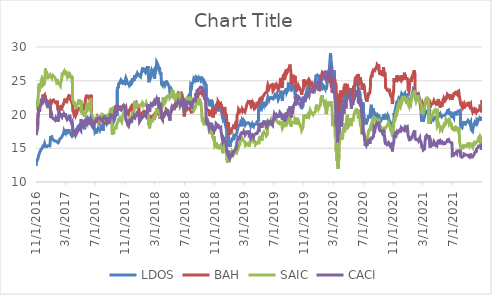
| Category | LDOS | BAH | SAIC | CACI |
|---|---|---|---|---|
| 11/1/16 | 12.394 | 18.057 | 22.082 | 16.935 |
| 11/2/16 | 12.337 | 18.748 | 21.898 | 16.935 |
| 11/3/16 | 13.289 | 19.079 | 21.998 | 17.208 |
| 11/4/16 | 13.101 | 18.947 | 20.738 | 17.488 |
| 11/7/16 | 13.227 | 19.271 | 21.367 | 17.897 |
| 11/8/16 | 13.026 | 19.301 | 21.473 | 18.178 |
| 11/9/16 | 13.478 | 20.167 | 22.561 | 19.498 |
| 11/10/16 | 13.724 | 20.107 | 22.758 | 20.102 |
| 11/11/16 | 13.906 | 20.63 | 24.046 | 20.732 |
| 11/14/16 | 14.191 | 21.123 | 24.602 | 21.03 |
| 11/15/16 | 14.346 | 21.081 | 24.131 | 20.399 |
| 11/16/16 | 14.331 | 21.123 | 24.022 | 20.852 |
| 11/17/16 | 14.236 | 21.044 | 23.904 | 21.15 |
| 11/18/16 | 14.478 | 21.111 | 24.037 | 21.235 |
| 11/21/16 | 14.804 | 21.399 | 24.457 | 21.473 |
| 11/22/16 | 14.81 | 21.946 | 25.02 | 21.992 |
| 11/23/16 | 14.879 | 22.175 | 25.092 | 21.924 |
| 11/25/16 | 14.963 | 22.241 | 25.386 | 21.882 |
| 11/28/16 | 15.044 | 22.361 | 25.389 | 21.822 |
| 11/29/16 | 15.346 | 22.962 | 25.494 | 22.248 |
| 11/30/16 | 15.328 | 22.728 | 24.968 | 22.035 |
| 12/1/16 | 15.328 | 22.15 | 24.403 | 21.839 |
| 12/2/16 | 15.439 | 22.565 | 24.539 | 22.12 |
| 12/5/16 | 15.532 | 22.565 | 24.569 | 22.452 |
| 12/6/16 | 15.682 | 22.818 | 24.748 | 22.682 |
| 12/7/16 | 15.604 | 22.613 | 24.832 | 22.393 |
| 12/8/16 | 15.648 | 22.776 | 25.978 | 22.478 |
| 12/9/16 | 15.643 | 22.662 | 26.807 | 22.452 |
| 12/12/16 | 15.059 | 21.946 | 25.727 | 21.856 |
| 12/13/16 | 15.274 | 22.144 | 25.679 | 21.643 |
| 12/14/16 | 15.268 | 21.862 | 25.476 | 21.541 |
| 12/15/16 | 15.319 | 21.796 | 25.506 | 21.533 |
| 12/16/16 | 15.319 | 21.844 | 25.237 | 21.337 |
| 12/19/16 | 15.37 | 21.928 | 25.818 | 21.499 |
| 12/20/16 | 15.406 | 21.988 | 25.9 | 21.524 |
| 12/21/16 | 15.376 | 21.85 | 25.806 | 21.226 |
| 12/22/16 | 15.292 | 21.814 | 25.57 | 21.218 |
| 12/23/16 | 15.286 | 21.742 | 25.688 | 21.311 |
| 12/27/16 | 15.343 | 21.802 | 25.791 | 21.345 |
| 12/28/16 | 15.238 | 21.646 | 25.485 | 21.098 |
| 12/29/16 | 15.385 | 21.79 | 25.821 | 21.337 |
| 12/30/16 | 16.633 | 21.969 | 25.643 | 19.493 |
| 1/3/17 | 16.571 | 21.756 | 25.425 | 19.501 |
| 1/4/17 | 16.701 | 21.872 | 25.833 | 19.846 |
| 1/5/17 | 16.513 | 21.89 | 25.664 | 19.572 |
| 1/6/17 | 16.477 | 22.055 | 25.888 | 19.525 |
| 1/9/17 | 16.256 | 21.982 | 25.513 | 19.438 |
| 1/10/17 | 16.35 | 22.201 | 25.715 | 19.423 |
| 1/11/17 | 16.295 | 22.158 | 25.624 | 19.438 |
| 1/12/17 | 16.259 | 22.158 | 25.718 | 19.399 |
| 1/13/17 | 16.249 | 22.128 | 25.646 | 19.383 |
| 1/17/17 | 16.074 | 21.805 | 25.446 | 19.18 |
| 1/18/17 | 16.204 | 21.835 | 25.425 | 19.336 |
| 1/19/17 | 16.161 | 21.677 | 25.295 | 19.172 |
| 1/20/17 | 16.152 | 21.708 | 25.162 | 19.321 |
| 1/23/17 | 16.028 | 21.634 | 24.829 | 19.023 |
| 1/24/17 | 16.09 | 21.799 | 24.896 | 19.368 |
| 1/25/17 | 16.148 | 21.823 | 24.914 | 19.289 |
| 1/26/17 | 16.113 | 22.048 | 25.035 | 19.282 |
| 1/27/17 | 16.116 | 22.085 | 25.25 | 19.211 |
| 1/30/17 | 15.813 | 20.648 | 24.475 | 18.944 |
| 1/31/17 | 15.716 | 20.599 | 24.62 | 19.258 |
| 2/1/17 | 15.712 | 20.514 | 24.43 | 19.328 |
| 2/2/17 | 15.966 | 20.995 | 24.805 | 20.63 |
| 2/3/17 | 16.161 | 21.019 | 24.567 | 20.418 |
| 2/6/17 | 16.301 | 21.08 | 24.463 | 20.301 |
| 2/7/17 | 16.415 | 21.123 | 24.549 | 20.277 |
| 2/8/17 | 16.292 | 20.818 | 24.252 | 19.791 |
| 2/9/17 | 16.529 | 20.83 | 24.546 | 19.995 |
| 2/10/17 | 16.535 | 20.77 | 24.78 | 19.83 |
| 2/13/17 | 16.584 | 20.782 | 25.152 | 19.815 |
| 2/14/17 | 16.607 | 20.739 | 25.178 | 19.619 |
| 2/15/17 | 16.789 | 21.05 | 25.654 | 19.783 |
| 2/16/17 | 16.916 | 21.172 | 26.194 | 20.011 |
| 2/17/17 | 16.896 | 21.141 | 26.031 | 19.87 |
| 2/21/17 | 17.127 | 21.549 | 26.257 | 20.034 |
| 2/22/17 | 17.28 | 21.695 | 26.29 | 20.175 |
| 2/23/17 | 17.072 | 21.525 | 26.147 | 19.705 |
| 2/24/17 | 17.589 | 21.878 | 26.426 | 19.987 |
| 2/27/17 | 17.576 | 22.341 | 26.509 | 20.081 |
| 2/28/17 | 17.336 | 21.787 | 25.835 | 19.666 |
| 3/1/17 | 17.788 | 22.042 | 26.486 | 20.144 |
| 3/2/17 | 17.414 | 22.048 | 26.394 | 19.713 |
| 3/3/17 | 17.462 | 21.957 | 26.153 | 19.658 |
| 3/6/17 | 17.293 | 21.89 | 25.936 | 19.391 |
| 3/7/17 | 17.244 | 22.036 | 25.957 | 19.297 |
| 3/8/17 | 17.144 | 22.116 | 25.82 | 19.227 |
| 3/9/17 | 17.215 | 22.176 | 25.55 | 19.195 |
| 3/10/17 | 17.176 | 22.396 | 25.633 | 19.18 |
| 3/13/17 | 17.547 | 22.633 | 25.856 | 19.423 |
| 3/14/17 | 17.459 | 22.524 | 25.936 | 19.399 |
| 3/15/17 | 17.846 | 22.81 | 26.257 | 19.674 |
| 3/16/17 | 17.479 | 22.682 | 25.817 | 19.485 |
| 3/17/17 | 17.547 | 22.913 | 26.007 | 19.94 |
| 3/20/17 | 17.524 | 22.737 | 25.847 | 19.674 |
| 3/21/17 | 17.17 | 22.28 | 25.375 | 19.156 |
| 3/22/17 | 17.196 | 22.359 | 25.645 | 19.18 |
| 3/23/17 | 17.134 | 22.286 | 25.871 | 19.227 |
| 3/24/17 | 17.114 | 22.152 | 25.574 | 18.976 |
| 3/27/17 | 16.822 | 21.774 | 25.458 | 18.615 |
| 3/28/17 | 16.815 | 21.805 | 25.39 | 18.725 |
| 3/29/17 | 16.988 | 21.774 | 25.621 | 18.788 |
| 3/30/17 | 16.692 | 21.543 | 22.27 | 18.544 |
| 3/31/17 | 17.672 | 20.538 | 22.101 | 17.755 |
| 4/3/17 | 17.468 | 20.358 | 21.697 | 17.157 |
| 4/4/17 | 17.523 | 20.294 | 21.938 | 17.157 |
| 4/5/17 | 17.261 | 20.044 | 21.596 | 17.127 |
| 4/6/17 | 17.295 | 20.091 | 21.658 | 17.233 |
| 4/7/17 | 17.496 | 20.253 | 21.697 | 17.384 |
| 4/10/17 | 17.492 | 20.282 | 21.552 | 17.551 |
| 4/11/17 | 17.624 | 20.497 | 21.658 | 17.619 |
| 4/12/17 | 17.537 | 20.172 | 21.234 | 17.293 |
| 4/13/17 | 17.499 | 19.928 | 20.824 | 17.006 |
| 4/17/17 | 17.72 | 20.265 | 21.299 | 17.301 |
| 4/18/17 | 17.748 | 20.334 | 21.293 | 17.316 |
| 4/19/17 | 17.879 | 20.497 | 21.403 | 17.452 |
| 4/20/17 | 18.176 | 20.735 | 21.593 | 17.77 |
| 4/21/17 | 18.042 | 20.688 | 21.48 | 17.558 |
| 4/24/17 | 18.29 | 20.752 | 22.048 | 18.088 |
| 4/25/17 | 18.366 | 20.834 | 22.062 | 17.974 |
| 4/26/17 | 18.453 | 21.089 | 22.282 | 18.33 |
| 4/27/17 | 18.436 | 20.996 | 22.033 | 18.262 |
| 4/28/17 | 18.197 | 20.851 | 21.682 | 17.861 |
| 5/1/17 | 18.484 | 20.799 | 21.822 | 17.959 |
| 5/2/17 | 18.508 | 20.648 | 21.777 | 17.861 |
| 5/3/17 | 18.522 | 20.602 | 21.575 | 17.611 |
| 5/4/17 | 18.795 | 20.805 | 22.074 | 19.291 |
| 5/5/17 | 18.823 | 20.799 | 20.484 | 19.125 |
| 5/8/17 | 18.422 | 20.758 | 20.22 | 19.11 |
| 5/9/17 | 18.159 | 20.648 | 19.994 | 18.852 |
| 5/10/17 | 18.118 | 20.741 | 20.148 | 18.913 |
| 5/11/17 | 18.211 | 20.776 | 19.959 | 18.648 |
| 5/12/17 | 18.201 | 20.886 | 20.11 | 18.603 |
| 5/15/17 | 18.246 | 21.159 | 20.484 | 18.777 |
| 5/16/17 | 18.56 | 21.106 | 20.484 | 18.92 |
| 5/17/17 | 18.062 | 20.677 | 19.662 | 18.489 |
| 5/18/17 | 17.807 | 20.654 | 19.824 | 18.239 |
| 5/19/17 | 18.007 | 20.863 | 19.766 | 18.383 |
| 5/22/17 | 18.443 | 22.342 | 20.173 | 18.807 |
| 5/23/17 | 18.892 | 22.244 | 20.39 | 18.822 |
| 5/24/17 | 18.971 | 22.377 | 20.596 | 18.883 |
| 5/25/17 | 19.051 | 22.743 | 21.025 | 19.193 |
| 5/26/17 | 18.964 | 22.772 | 21.209 | 19.254 |
| 5/30/17 | 18.954 | 22.778 | 20.877 | 18.754 |
| 5/31/17 | 19.199 | 22.888 | 20.885 | 18.633 |
| 6/1/17 | 19.479 | 22.871 | 21.193 | 19.117 |
| 6/2/17 | 19.334 | 22.76 | 21.352 | 18.89 |
| 6/5/17 | 19.31 | 22.546 | 21.355 | 18.731 |
| 6/6/17 | 19.327 | 22.209 | 20.981 | 18.731 |
| 6/7/17 | 19.237 | 22.372 | 20.879 | 18.519 |
| 6/8/17 | 19.258 | 22.58 | 21.22 | 18.754 |
| 6/9/17 | 19.134 | 22.383 | 21.176 | 18.694 |
| 6/12/17 | 19.22 | 22.633 | 22.383 | 19.405 |
| 6/13/17 | 19.244 | 22.743 | 20.481 | 19.299 |
| 6/14/17 | 19.054 | 22.94 | 20.385 | 19.216 |
| 6/15/17 | 19.065 | 22.824 | 20.291 | 19.087 |
| 6/16/17 | 18.653 | 18.512 | 19.511 | 18.383 |
| 6/19/17 | 18.636 | 18.837 | 19.59 | 18.308 |
| 6/20/17 | 18.446 | 18.704 | 19.607 | 18.164 |
| 6/21/17 | 18.574 | 18.774 | 19.632 | 18.292 |
| 6/22/17 | 18.526 | 19.087 | 19.64 | 19.057 |
| 6/23/17 | 18.508 | 18.698 | 19.464 | 18.852 |
| 6/26/17 | 18.56 | 18.832 | 19.324 | 18.694 |
| 6/27/17 | 18.021 | 18.704 | 19.013 | 18.565 |
| 6/28/17 | 18.066 | 18.971 | 19.414 | 19.057 |
| 6/29/17 | 17.783 | 18.774 | 18.991 | 18.852 |
| 6/30/17 | 17.366 | 18.696 | 19.079 | 18.963 |
| 7/3/17 | 17.474 | 18.702 | 19.285 | 19.122 |
| 7/5/17 | 17.591 | 19.024 | 19.398 | 19.054 |
| 7/6/17 | 17.198 | 18.944 | 19.126 | 18.836 |
| 7/7/17 | 17.494 | 19.392 | 19.563 | 19.32 |
| 7/10/17 | 17.494 | 19.11 | 19.316 | 19.198 |
| 7/11/17 | 17.544 | 19.202 | 19.588 | 19.388 |
| 7/12/17 | 17.836 | 19.455 | 19.893 | 19.388 |
| 7/13/17 | 17.675 | 19.449 | 19.725 | 19.297 |
| 7/14/17 | 17.887 | 19.438 | 19.761 | 19.456 |
| 7/17/17 | 17.833 | 18.961 | 19.404 | 19.494 |
| 7/18/17 | 17.668 | 18.961 | 19.11 | 19.342 |
| 7/19/17 | 17.937 | 19.254 | 19.524 | 19.547 |
| 7/20/17 | 18.015 | 19.271 | 19.423 | 19.479 |
| 7/21/17 | 17.954 | 19.34 | 19.228 | 19.304 |
| 7/24/17 | 17.924 | 19.443 | 19.142 | 19.327 |
| 7/25/17 | 18.105 | 19.616 | 19.492 | 19.357 |
| 7/26/17 | 17.968 | 19.627 | 19.728 | 19.115 |
| 7/27/17 | 17.941 | 19.506 | 19.643 | 19.153 |
| 7/28/17 | 18.008 | 19.685 | 19.632 | 19.206 |
| 7/31/17 | 17.954 | 19.708 | 19.351 | 18.971 |
| 8/1/17 | 17.914 | 19.759 | 19.728 | 19.471 |
| 8/2/17 | 17.561 | 19.547 | 19.274 | 19.191 |
| 8/3/17 | 19.029 | 19.8 | 19.879 | 19.471 |
| 8/4/17 | 18.878 | 19.886 | 19.939 | 19.524 |
| 8/7/17 | 18.932 | 19.185 | 19.908 | 19.661 |
| 8/8/17 | 19.036 | 19.047 | 19.718 | 19.752 |
| 8/9/17 | 18.875 | 18.558 | 19.42 | 19.585 |
| 8/10/17 | 18.972 | 18.771 | 19.3 | 19.539 |
| 8/11/17 | 19.043 | 19.11 | 19.312 | 19.494 |
| 8/14/17 | 19.274 | 19.357 | 19.682 | 19.426 |
| 8/15/17 | 19.251 | 19.363 | 19.68 | 19.342 |
| 8/16/17 | 19.221 | 19.506 | 20.011 | 19.532 |
| 8/17/17 | 18.794 | 19.254 | 19.392 | 19.001 |
| 8/18/17 | 18.592 | 19.351 | 19.267 | 18.652 |
| 8/21/17 | 18.582 | 19.489 | 19.418 | 18.781 |
| 8/22/17 | 18.784 | 19.782 | 19.841 | 19.145 |
| 8/23/17 | 18.888 | 19.754 | 19.749 | 19.024 |
| 8/24/17 | 18.663 | 19.535 | 19.941 | 18.963 |
| 8/25/17 | 18.767 | 19.518 | 19.902 | 18.933 |
| 8/28/17 | 18.781 | 19.271 | 19.905 | 19.001 |
| 8/29/17 | 19.022 | 19.489 | 20.028 | 19.107 |
| 8/30/17 | 19.264 | 19.472 | 20.348 | 19.092 |
| 8/31/17 | 19.594 | 19.598 | 20.588 | 19.683 |
| 9/1/17 | 19.735 | 19.914 | 20.738 | 19.964 |
| 9/5/17 | 19.419 | 19.794 | 20.755 | 19.941 |
| 9/6/17 | 19.473 | 19.96 | 20.858 | 19.881 |
| 9/7/17 | 19.385 | 19.972 | 20.805 | 19.6 |
| 9/8/17 | 19.187 | 19.926 | 17.015 | 19.342 |
| 9/11/17 | 19.288 | 20.035 | 17.085 | 19.744 |
| 9/12/17 | 19.379 | 20.121 | 17.325 | 20.01 |
| 9/13/17 | 19.197 | 19.88 | 17.342 | 19.956 |
| 9/14/17 | 18.925 | 19.794 | 17.135 | 19.562 |
| 9/15/17 | 18.948 | 20.254 | 17.634 | 19.691 |
| 9/18/17 | 19.261 | 20.644 | 17.634 | 19.903 |
| 9/19/17 | 19.493 | 20.88 | 18.086 | 20.252 |
| 9/20/17 | 19.543 | 21.127 | 18.164 | 20.426 |
| 9/21/17 | 19.577 | 21.173 | 18.158 | 20.381 |
| 9/22/17 | 19.765 | 21.178 | 18.021 | 20.707 |
| 9/25/17 | 19.681 | 21.178 | 18.021 | 20.836 |
| 9/26/17 | 19.731 | 21.345 | 18.275 | 20.889 |
| 9/27/17 | 19.966 | 21.403 | 18.59 | 21.427 |
| 9/28/17 | 19.792 | 21.351 | 18.587 | 21.185 |
| 9/29/17 | 23.644 | 20.666 | 18.629 | 20.632 |
| 10/2/17 | 24.119 | 20.831 | 18.913 | 21.054 |
| 10/3/17 | 23.924 | 20.969 | 18.866 | 21.083 |
| 10/4/17 | 24.055 | 21.008 | 19.025 | 20.95 |
| 10/5/17 | 24.566 | 20.964 | 19.342 | 21.113 |
| 10/6/17 | 24.654 | 20.831 | 19.337 | 21.054 |
| 10/9/17 | 24.754 | 20.804 | 19.498 | 21.12 |
| 10/10/17 | 24.814 | 20.886 | 19.599 | 21.216 |
| 10/11/17 | 24.81 | 20.726 | 19.518 | 21.046 |
| 10/12/17 | 24.882 | 21.185 | 19.278 | 21.068 |
| 10/13/17 | 25.057 | 21.312 | 19.214 | 21.246 |
| 10/16/17 | 24.786 | 21.063 | 19.175 | 21.098 |
| 10/17/17 | 24.682 | 20.787 | 18.919 | 20.942 |
| 10/18/17 | 24.514 | 20.859 | 19.153 | 20.957 |
| 10/19/17 | 24.562 | 20.876 | 19.462 | 20.965 |
| 10/20/17 | 24.826 | 20.969 | 19.752 | 21.194 |
| 10/23/17 | 24.666 | 20.859 | 19.911 | 21.179 |
| 10/24/17 | 24.45 | 20.853 | 20.117 | 21.216 |
| 10/25/17 | 25.049 | 20.765 | 20.334 | 21.401 |
| 10/26/17 | 24.942 | 20.71 | 20.404 | 21.438 |
| 10/27/17 | 24.898 | 20.748 | 20.524 | 21.416 |
| 10/30/17 | 24.73 | 20.671 | 20.206 | 21.209 |
| 10/31/17 | 24.962 | 20.886 | 20.438 | 21.283 |
| 11/1/17 | 25.085 | 20.876 | 20.304 | 21.046 |
| 11/2/17 | 25.081 | 20.898 | 19.972 | 19.758 |
| 11/3/17 | 25.417 | 21.074 | 19.468 | 19.247 |
| 11/6/17 | 25.133 | 20.229 | 19.394 | 18.966 |
| 11/7/17 | 24.986 | 20.666 | 19.077 | 19.218 |
| 11/8/17 | 24.842 | 20.489 | 19.052 | 19.114 |
| 11/9/17 | 24.614 | 20.24 | 18.92 | 18.699 |
| 11/10/17 | 24.702 | 20.223 | 18.901 | 18.477 |
| 11/13/17 | 24.606 | 20.03 | 18.799 | 18.492 |
| 11/14/17 | 24.506 | 20.223 | 18.755 | 18.277 |
| 11/15/17 | 24.67 | 20.135 | 18.702 | 18.196 |
| 11/16/17 | 24.69 | 20.505 | 19.14 | 18.611 |
| 11/17/17 | 24.391 | 20.461 | 19 | 18.536 |
| 11/20/17 | 24.61 | 20.544 | 19.311 | 18.788 |
| 11/21/17 | 24.534 | 20.87 | 19.763 | 19.395 |
| 11/22/17 | 24.395 | 20.699 | 19.543 | 18.936 |
| 11/24/17 | 24.478 | 20.605 | 19.562 | 18.958 |
| 11/27/17 | 24.578 | 20.61 | 19.606 | 18.951 |
| 11/28/17 | 25.069 | 20.859 | 19.959 | 19.225 |
| 11/29/17 | 24.91 | 21.003 | 20.229 | 19.225 |
| 11/30/17 | 25.381 | 21.384 | 20.441 | 19.536 |
| 12/1/17 | 24.882 | 21.307 | 20.13 | 19.395 |
| 12/4/17 | 25.337 | 21.334 | 20.174 | 19.432 |
| 12/5/17 | 25.289 | 21.312 | 20.185 | 19.454 |
| 12/6/17 | 24.998 | 21.069 | 20.13 | 19.299 |
| 12/7/17 | 25.225 | 21.063 | 20.78 | 19.499 |
| 12/8/17 | 25.604 | 21.119 | 22.03 | 19.765 |
| 12/11/17 | 25.668 | 21.207 | 21.678 | 19.588 |
| 12/12/17 | 25.608 | 21.412 | 21.284 | 19.588 |
| 12/13/17 | 25.576 | 21.18 | 21.298 | 19.817 |
| 12/14/17 | 25.5 | 20.931 | 20.981 | 19.684 |
| 12/15/17 | 25.792 | 21.119 | 21.386 | 19.943 |
| 12/18/17 | 26.028 | 21.594 | 21.551 | 20.172 |
| 12/19/17 | 25.848 | 21.533 | 21.526 | 20.017 |
| 12/20/17 | 25.964 | 21.467 | 21.405 | 20.054 |
| 12/21/17 | 25.992 | 21.367 | 21.289 | 19.943 |
| 12/22/17 | 26.04 | 21.4 | 21.298 | 19.854 |
| 12/26/17 | 25.868 | 21.19 | 21.22 | 19.788 |
| 12/27/17 | 25.808 | 21.251 | 21.22 | 19.684 |
| 12/28/17 | 25.88 | 21.168 | 21.237 | 19.706 |
| 12/29/17 | 25.808 | 19.597 | 21.094 | 18.932 |
| 1/2/18 | 25.58 | 19.509 | 21.364 | 19.19 |
| 1/3/18 | 25.548 | 19.561 | 21.317 | 19.712 |
| 1/4/18 | 25.9 | 19.55 | 21.477 | 19.54 |
| 1/5/18 | 25.872 | 19.715 | 21.485 | 19.619 |
| 1/8/18 | 26.531 | 20.183 | 21.675 | 19.776 |
| 1/9/18 | 26.476 | 20.044 | 21.609 | 19.712 |
| 1/10/18 | 26.611 | 20.131 | 21.485 | 19.698 |
| 1/11/18 | 26.955 | 20.172 | 21.694 | 20.22 |
| 1/12/18 | 26.791 | 20.193 | 21.556 | 19.648 |
| 1/16/18 | 26.555 | 20.486 | 21.402 | 19.655 |
| 1/17/18 | 26.747 | 20.568 | 21.537 | 19.862 |
| 1/18/18 | 26.511 | 20.368 | 21.179 | 19.662 |
| 1/19/18 | 26.835 | 20.378 | 21.355 | 19.955 |
| 1/22/18 | 26.831 | 20.362 | 21.339 | 19.841 |
| 1/23/18 | 26.755 | 20.352 | 21.504 | 19.955 |
| 1/24/18 | 26.316 | 20.239 | 21.264 | 19.705 |
| 1/25/18 | 26.348 | 20.275 | 21.463 | 19.876 |
| 1/26/18 | 26.495 | 20.434 | 21.625 | 20.256 |
| 1/29/18 | 27.059 | 20.512 | 21.523 | 20.599 |
| 1/30/18 | 26.651 | 20.26 | 21.198 | 20.12 |
| 1/31/18 | 26.619 | 20.136 | 21.116 | 20.105 |
| 2/1/18 | 27.159 | 20.352 | 21.284 | 21.522 |
| 2/2/18 | 26.472 | 19.869 | 19.788 | 20.999 |
| 2/5/18 | 25.232 | 18.882 | 18.983 | 20.406 |
| 2/6/18 | 24.769 | 18.466 | 18.508 | 20.534 |
| 2/7/18 | 25.7 | 19.17 | 18.434 | 20.892 |
| 2/8/18 | 25.005 | 18.749 | 17.942 | 20.377 |
| 2/9/18 | 25.029 | 18.677 | 18.265 | 20.592 |
| 2/12/18 | 25.716 | 19.216 | 18.755 | 21.343 |
| 2/13/18 | 25.828 | 19.144 | 18.736 | 21.286 |
| 2/14/18 | 26.272 | 19.478 | 19.11 | 21.564 |
| 2/15/18 | 26.412 | 19.684 | 19.187 | 21.529 |
| 2/16/18 | 26.547 | 19.684 | 18.993 | 21.479 |
| 2/20/18 | 26.472 | 19.648 | 19.033 | 21.328 |
| 2/21/18 | 26.064 | 19.581 | 19.213 | 21.328 |
| 2/22/18 | 26.28 | 19.561 | 19.391 | 21.5 |
| 2/23/18 | 26.312 | 19.787 | 19.327 | 21.679 |
| 2/26/18 | 26.539 | 19.941 | 19.624 | 21.915 |
| 2/27/18 | 26.068 | 19.766 | 19.677 | 21.75 |
| 2/28/18 | 25.304 | 19.494 | 19.176 | 21.321 |
| 3/1/18 | 25.484 | 19.566 | 19.147 | 21.4 |
| 3/2/18 | 25.98 | 19.962 | 19.703 | 21.507 |
| 3/5/18 | 26.352 | 20.178 | 19.997 | 21.886 |
| 3/6/18 | 26.46 | 20.126 | 20.214 | 21.929 |
| 3/7/18 | 26.635 | 20.183 | 20.087 | 21.929 |
| 3/8/18 | 27.143 | 20.152 | 20.188 | 22.029 |
| 3/9/18 | 27.746 | 20.378 | 20.94 | 22.315 |
| 3/12/18 | 27.714 | 20.162 | 20.81 | 21.958 |
| 3/13/18 | 27.698 | 20.07 | 20.522 | 22.044 |
| 3/14/18 | 27.391 | 20.09 | 20.463 | 22.108 |
| 3/15/18 | 27.187 | 20.09 | 20.498 | 22.051 |
| 3/16/18 | 27.063 | 20.301 | 20.54 | 22.523 |
| 3/19/18 | 26.839 | 19.941 | 20.336 | 20.828 |
| 3/20/18 | 27.011 | 20.147 | 20.461 | 21.693 |
| 3/21/18 | 26.999 | 20.219 | 20.477 | 21.536 |
| 3/22/18 | 26.372 | 19.741 | 20.05 | 21.15 |
| 3/23/18 | 25.988 | 19.355 | 19.56 | 20.992 |
| 3/26/18 | 26.232 | 19.643 | 19.915 | 21.185 |
| 3/27/18 | 25.78 | 19.576 | 19.558 | 21.307 |
| 3/28/18 | 25.684 | 19.566 | 19.409 | 21.3 |
| 3/29/18 | 24.48 | 19.686 | 20.874 | 19.588 |
| 4/2/18 | 24.285 | 19.259 | 21.218 | 19.277 |
| 4/3/18 | 24.461 | 19.722 | 21.904 | 19.594 |
| 4/4/18 | 24.618 | 19.925 | 22.069 | 19.769 |
| 4/5/18 | 24.884 | 20.068 | 22.598 | 20.054 |
| 4/6/18 | 24.278 | 19.747 | 21.716 | 19.594 |
| 4/9/18 | 24.248 | 19.742 | 21.563 | 19.62 |
| 4/10/18 | 24.641 | 20.037 | 21.576 | 19.976 |
| 4/11/18 | 24.352 | 20.052 | 21.52 | 19.892 |
| 4/12/18 | 24.588 | 20.235 | 21.711 | 20.034 |
| 4/13/18 | 24.416 | 20.174 | 21.817 | 19.931 |
| 4/16/18 | 24.674 | 20.612 | 22.053 | 20.112 |
| 4/17/18 | 25.015 | 20.795 | 22.283 | 20.378 |
| 4/18/18 | 25.15 | 20.825 | 22.773 | 20.61 |
| 4/19/18 | 24.996 | 20.724 | 22.734 | 20.559 |
| 4/20/18 | 24.753 | 20.652 | 22.59 | 20.565 |
| 4/23/18 | 24.794 | 20.586 | 22.72 | 20.61 |
| 4/24/18 | 24.558 | 20.398 | 22.768 | 20.293 |
| 4/25/18 | 24.524 | 20.251 | 22.861 | 19.983 |
| 4/26/18 | 24.558 | 20.368 | 22.85 | 20.112 |
| 4/27/18 | 24.622 | 20.312 | 22.826 | 19.847 |
| 4/30/18 | 24.042 | 20.149 | 22.726 | 19.549 |
| 5/1/18 | 23.761 | 20.052 | 22.755 | 19.413 |
| 5/2/18 | 23.222 | 19.94 | 22.466 | 19.096 |
| 5/3/18 | 22.559 | 19.966 | 22.564 | 19.737 |
| 5/4/18 | 22.507 | 20.2 | 22.473 | 20.177 |
| 5/7/18 | 22.769 | 20.357 | 22.682 | 20.436 |
| 5/8/18 | 23.031 | 20.551 | 22.97 | 20.72 |
| 5/9/18 | 23.405 | 20.637 | 23.307 | 20.805 |
| 5/10/18 | 23.611 | 20.744 | 23.435 | 20.966 |
| 5/11/18 | 23.682 | 20.769 | 23.456 | 21.193 |
| 5/14/18 | 23.319 | 20.662 | 23.221 | 21.122 |
| 5/15/18 | 23.031 | 20.83 | 23.268 | 21.025 |
| 5/16/18 | 23.012 | 20.978 | 23.555 | 21.199 |
| 5/17/18 | 22.743 | 20.947 | 22.533 | 21.251 |
| 5/18/18 | 22.949 | 21.191 | 22.486 | 21.264 |
| 5/21/18 | 22.982 | 21.201 | 22.382 | 21.38 |
| 5/22/18 | 22.387 | 20.978 | 22.154 | 21.122 |
| 5/23/18 | 22.683 | 20.988 | 22.222 | 21.16 |
| 5/24/18 | 22.586 | 21.176 | 22.35 | 21.128 |
| 5/25/18 | 22.556 | 21.247 | 22.063 | 21.16 |
| 5/29/18 | 22.38 | 22.381 | 22.157 | 21.219 |
| 5/30/18 | 22.679 | 22.9 | 22.915 | 21.691 |
| 5/31/18 | 22.481 | 22.925 | 23.124 | 21.568 |
| 6/1/18 | 22.773 | 22.788 | 22.894 | 21.555 |
| 6/4/18 | 23.054 | 23.083 | 22.847 | 21.665 |
| 6/5/18 | 23.173 | 22.986 | 22.92 | 21.82 |
| 6/6/18 | 23.184 | 22.94 | 23.025 | 21.801 |
| 6/7/18 | 22.848 | 22.676 | 22.941 | 21.626 |
| 6/8/18 | 22.941 | 22.712 | 23.059 | 21.872 |
| 6/11/18 | 23.054 | 22.767 | 23.066 | 21.898 |
| 6/12/18 | 23.162 | 22.915 | 23.027 | 21.704 |
| 6/13/18 | 23.117 | 22.986 | 21.095 | 21.504 |
| 6/14/18 | 22.739 | 23.113 | 21.192 | 21.549 |
| 6/15/18 | 22.526 | 22.894 | 20.98 | 21.691 |
| 6/18/18 | 22.271 | 22.996 | 21.31 | 21.652 |
| 6/19/18 | 22.271 | 23.093 | 21.364 | 21.659 |
| 6/20/18 | 21.841 | 23.159 | 21.281 | 21.225 |
| 6/21/18 | 21.68 | 22.92 | 21.391 | 22.358 |
| 6/22/18 | 21.897 | 22.676 | 21.425 | 22.254 |
| 6/25/18 | 22.028 | 22.406 | 21.247 | 21.756 |
| 6/26/18 | 22.327 | 22.35 | 21.472 | 21.82 |
| 6/27/18 | 21.916 | 22.04 | 21.498 | 21.834 |
| 6/28/18 | 21.953 | 22.112 | 21.443 | 21.749 |
| 6/29/18 | 21.055 | 19.713 | 21.158 | 20.581 |
| 7/2/18 | 21.191 | 20.101 | 21.325 | 20.838 |
| 7/3/18 | 21.134 | 20.399 | 21.425 | 21.112 |
| 7/5/18 | 21.277 | 20.318 | 21.485 | 21.222 |
| 7/6/18 | 21.476 | 20.592 | 21.83 | 21.692 |
| 7/9/18 | 21.89 | 20.633 | 22.185 | 21.607 |
| 7/10/18 | 21.865 | 20.656 | 22.125 | 21.375 |
| 7/11/18 | 21.926 | 20.696 | 22.026 | 21.656 |
| 7/12/18 | 22.29 | 20.831 | 22.295 | 21.882 |
| 7/13/18 | 22.279 | 20.962 | 22.311 | 21.778 |
| 7/16/18 | 22.301 | 20.858 | 22.204 | 21.747 |
| 7/17/18 | 22.69 | 20.953 | 22.499 | 21.851 |
| 7/18/18 | 22.665 | 20.913 | 22.52 | 21.772 |
| 7/19/18 | 22.858 | 20.967 | 22.598 | 21.796 |
| 7/20/18 | 22.961 | 20.976 | 22.562 | 21.924 |
| 7/23/18 | 23.029 | 20.876 | 22.436 | 21.79 |
| 7/24/18 | 22.561 | 20.71 | 22.133 | 21.442 |
| 7/25/18 | 22.75 | 20.696 | 22.212 | 21.619 |
| 7/26/18 | 24.342 | 20.854 | 22.413 | 21.601 |
| 7/27/18 | 24.435 | 20.62 | 22.01 | 21.509 |
| 7/30/18 | 24.114 | 20.196 | 21.555 | 20.88 |
| 7/31/18 | 24.417 | 21.309 | 22.057 | 21.393 |
| 8/1/18 | 24.488 | 21.26 | 21.89 | 21.418 |
| 8/2/18 | 24.695 | 21.39 | 22.149 | 21.644 |
| 8/3/18 | 24.835 | 21.512 | 20.52 | 21.619 |
| 8/6/18 | 24.867 | 21.868 | 20.659 | 22.169 |
| 8/7/18 | 24.902 | 21.999 | 20.621 | 21.979 |
| 8/8/18 | 25.313 | 22.202 | 20.907 | 22.218 |
| 8/9/18 | 25.209 | 22.206 | 20.866 | 22.211 |
| 8/10/18 | 25.177 | 22.148 | 20.724 | 21.998 |
| 8/13/18 | 25.081 | 22.062 | 20.7 | 21.992 |
| 8/14/18 | 25.359 | 22.256 | 21.011 | 22.132 |
| 8/15/18 | 25.202 | 22.17 | 20.869 | 22.022 |
| 8/16/18 | 25.266 | 22.206 | 21.119 | 23.127 |
| 8/17/18 | 25.595 | 22.423 | 21.417 | 22.858 |
| 8/20/18 | 25.523 | 22.477 | 21.326 | 23.072 |
| 8/21/18 | 25.691 | 22.675 | 21.882 | 23.64 |
| 8/22/18 | 25.463 | 22.738 | 21.863 | 23.646 |
| 8/23/18 | 24.813 | 22.459 | 21.497 | 23.451 |
| 8/24/18 | 25.052 | 22.698 | 21.774 | 23.64 |
| 8/27/18 | 25.298 | 23.018 | 22.029 | 23.738 |
| 8/28/18 | 25.124 | 22.892 | 22.041 | 23.67 |
| 8/29/18 | 25.384 | 23.045 | 22.421 | 23.786 |
| 8/30/18 | 25.341 | 23.04 | 21.942 | 23.75 |
| 8/31/18 | 25.256 | 23.063 | 21.713 | 23.811 |
| 9/4/18 | 25.42 | 23.194 | 21.908 | 24.025 |
| 9/5/18 | 25.241 | 23.342 | 21.913 | 24.244 |
| 9/6/18 | 25.32 | 23.559 | 21.81 | 23.97 |
| 9/7/18 | 24.92 | 23.491 | 21.627 | 23.951 |
| 9/10/18 | 24.981 | 23.167 | 19.651 | 23.762 |
| 9/11/18 | 25.056 | 23.293 | 19.324 | 23.756 |
| 9/12/18 | 25.056 | 23.36 | 18.864 | 23.756 |
| 9/13/18 | 25.295 | 23.396 | 18.895 | 23.848 |
| 9/14/18 | 25.398 | 23.626 | 19.141 | 23.915 |
| 9/17/18 | 25.188 | 23.424 | 18.772 | 23.689 |
| 9/18/18 | 25.066 | 23.257 | 18.715 | 23.677 |
| 9/19/18 | 24.424 | 22.59 | 18.402 | 22.987 |
| 9/20/18 | 24.535 | 22.418 | 18.659 | 22.596 |
| 9/21/18 | 24.895 | 22.346 | 19.117 | 22.755 |
| 9/24/18 | 24.267 | 22.342 | 18.977 | 23.005 |
| 9/25/18 | 24.567 | 22.459 | 19.523 | 22.45 |
| 9/26/18 | 24.246 | 22.477 | 19.179 | 22.498 |
| 9/27/18 | 24.421 | 22.436 | 19.143 | 22.498 |
| 9/28/18 | 22.677 | 20.747 | 19.398 | 18.85 |
| 10/1/18 | 22.251 | 20.722 | 18.989 | 18.655 |
| 10/2/18 | 22.471 | 20.726 | 19.004 | 18.657 |
| 10/3/18 | 22.205 | 20.692 | 18.917 | 18.718 |
| 10/4/18 | 22.198 | 20.659 | 18.541 | 18.653 |
| 10/5/18 | 22.136 | 20.709 | 18.354 | 18.939 |
| 10/8/18 | 22.031 | 20.588 | 18.32 | 18.819 |
| 10/9/18 | 22.035 | 20.726 | 18.279 | 18.824 |
| 10/10/18 | 21.651 | 20.099 | 17.6 | 18.415 |
| 10/11/18 | 21.231 | 19.756 | 17.403 | 18.001 |
| 10/12/18 | 21.339 | 19.94 | 17.109 | 18.112 |
| 10/15/18 | 21.605 | 20.187 | 17.372 | 18.309 |
| 10/16/18 | 22.176 | 20.613 | 17.892 | 18.79 |
| 10/17/18 | 22.198 | 20.55 | 17.562 | 18.756 |
| 10/18/18 | 21.874 | 20.316 | 17.102 | 18.542 |
| 10/19/18 | 22.156 | 20.492 | 17.167 | 18.452 |
| 10/22/18 | 22.015 | 20.651 | 17.494 | 18.674 |
| 10/23/18 | 21.792 | 20.638 | 17.531 | 18.379 |
| 10/24/18 | 20.53 | 19.748 | 16.717 | 17.653 |
| 10/25/18 | 20.074 | 19.978 | 16.638 | 17.854 |
| 10/26/18 | 20.077 | 19.572 | 16.508 | 17.706 |
| 10/29/18 | 20.274 | 20.35 | 16.173 | 17.597 |
| 10/30/18 | 20.697 | 20.09 | 16.253 | 17.857 |
| 10/31/18 | 21.241 | 20.709 | 16.729 | 18.267 |
| 11/1/18 | 20.776 | 20.107 | 16.852 | 17.708 |
| 11/2/18 | 20.461 | 19.982 | 15.281 | 17.669 |
| 11/5/18 | 20.516 | 20.116 | 15.261 | 17.67 |
| 11/6/18 | 20.825 | 20.484 | 15.457 | 17.963 |
| 11/7/18 | 21.526 | 21.223 | 15.824 | 18.657 |
| 11/8/18 | 21.585 | 21.265 | 15.736 | 18.658 |
| 11/9/18 | 21.389 | 21.491 | 15.789 | 18.581 |
| 11/12/18 | 21.11 | 21.524 | 15.303 | 18.472 |
| 11/13/18 | 21.136 | 21.662 | 15.439 | 18.484 |
| 11/14/18 | 20.752 | 21.412 | 14.957 | 18.083 |
| 11/15/18 | 21.1 | 21.963 | 15.373 | 18.491 |
| 11/16/18 | 21.212 | 22.038 | 15.527 | 18.469 |
| 11/19/18 | 20.956 | 21.696 | 15.034 | 18.014 |
| 11/20/18 | 20.474 | 21.328 | 14.84 | 17.861 |
| 11/21/18 | 20.67 | 21.407 | 15.067 | 18.071 |
| 11/23/18 | 20.625 | 21.34 | 15.201 | 17.934 |
| 11/26/18 | 20.92 | 21.566 | 15.375 | 18.134 |
| 11/27/18 | 20.576 | 21.307 | 15.151 | 17.462 |
| 11/28/18 | 20.73 | 21.47 | 15.415 | 17.496 |
| 11/29/18 | 20.356 | 21.303 | 15.309 | 17.229 |
| 11/30/18 | 20.657 | 21.449 | 15.309 | 16.88 |
| 12/3/18 | 20.52 | 21.328 | 15.322 | 16.831 |
| 12/4/18 | 19.329 | 20.692 | 14.265 | 16.083 |
| 12/6/18 | 19.759 | 20.722 | 14.301 | 16.275 |
| 12/7/18 | 19.303 | 20.308 | 15.283 | 16.088 |
| 12/10/18 | 19.503 | 20.517 | 15.356 | 16.301 |
| 12/11/18 | 19.208 | 20.626 | 15.228 | 16.285 |
| 12/12/18 | 19.503 | 21.119 | 15.8 | 16.686 |
| 12/13/18 | 19.162 | 21.056 | 15.342 | 16.499 |
| 12/14/18 | 18.706 | 20.534 | 15.065 | 16.303 |
| 12/17/18 | 18.202 | 19.932 | 14.915 | 15.654 |
| 12/18/18 | 18.182 | 20.09 | 14.649 | 15.572 |
| 12/19/18 | 17.867 | 19.735 | 14.162 | 15.519 |
| 12/20/18 | 17.585 | 19.476 | 13.933 | 15.103 |
| 12/21/18 | 16.857 | 18.715 | 13.308 | 14.521 |
| 12/24/18 | 16.572 | 18.168 | 12.856 | 14.271 |
| 12/26/18 | 17.178 | 18.845 | 13.669 | 14.662 |
| 12/27/18 | 17.234 | 18.711 | 13.691 | 14.65 |
| 12/28/18 | 15.504 | 18.811 | 13.794 | 14.734 |
| 12/31/18 | 15.598 | 17.295 | 14.028 | 13.657 |
| 1/2/19 | 15.4 | 17.011 | 13.95 | 13.458 |
| 1/3/19 | 15.187 | 16.873 | 13.548 | 13.352 |
| 1/4/19 | 15.794 | 17.56 | 14.087 | 13.711 |
| 1/7/19 | 15.829 | 17.498 | 14.129 | 13.567 |
| 1/8/19 | 15.95 | 17.614 | 14.424 | 13.954 |
| 1/9/19 | 16.146 | 17.487 | 14.237 | 14.08 |
| 1/10/19 | 16.246 | 17.552 | 14.217 | 14.086 |
| 1/11/19 | 16.397 | 17.92 | 14.32 | 14.187 |
| 1/14/19 | 16.37 | 17.805 | 14.124 | 14.012 |
| 1/15/19 | 16.388 | 17.909 | 13.937 | 14.147 |
| 1/16/19 | 16.356 | 18.074 | 14.006 | 14.247 |
| 1/17/19 | 16.592 | 18.243 | 14.457 | 14.561 |
| 1/18/19 | 16.829 | 18.262 | 14.536 | 14.69 |
| 1/22/19 | 16.604 | 18.078 | 14.424 | 14.619 |
| 1/23/19 | 16.613 | 18.201 | 14.14 | 14.68 |
| 1/24/19 | 16.678 | 18.212 | 14.153 | 14.796 |
| 1/25/19 | 16.879 | 18.554 | 14.842 | 14.93 |
| 1/28/19 | 16.891 | 18.327 | 14.679 | 14.805 |
| 1/29/19 | 17.016 | 18.416 | 14.842 | 14.953 |
| 1/30/19 | 17.217 | 18.527 | 14.88 | 15.061 |
| 1/31/19 | 17.16 | 18.853 | 14.785 | 15.852 |
| 2/1/19 | 17.498 | 19.797 | 14.509 | 15.972 |
| 2/4/19 | 17.965 | 20.169 | 14.814 | 16.349 |
| 2/5/19 | 18.131 | 20.304 | 14.936 | 16.624 |
| 2/6/19 | 18.184 | 20.465 | 15.056 | 16.642 |
| 2/7/19 | 18.557 | 20.772 | 15.187 | 16.652 |
| 2/8/19 | 18.368 | 20.894 | 15.318 | 16.644 |
| 2/11/19 | 18.326 | 20.515 | 15.303 | 16.504 |
| 2/12/19 | 18.35 | 20.672 | 15.591 | 16.502 |
| 2/13/19 | 18.409 | 20.515 | 15.859 | 16.776 |
| 2/14/19 | 18.442 | 20.438 | 16.003 | 16.898 |
| 2/15/19 | 18.749 | 20.645 | 16.436 | 17.073 |
| 2/19/19 | 18.436 | 20.741 | 16.507 | 17.08 |
| 2/20/19 | 18.249 | 20.63 | 16.417 | 17.323 |
| 2/21/19 | 18.625 | 20.591 | 16.249 | 17.257 |
| 2/22/19 | 19.081 | 20.764 | 16.438 | 17.436 |
| 2/25/19 | 19.131 | 20.507 | 16.37 | 17.312 |
| 2/26/19 | 18.802 | 20.254 | 16.131 | 17.031 |
| 2/27/19 | 18.912 | 20.234 | 16.138 | 17.161 |
| 2/28/19 | 19.11 | 20.284 | 16.03 | 17.282 |
| 3/1/19 | 19.226 | 20.538 | 16.239 | 17.476 |
| 3/4/19 | 18.965 | 20.419 | 15.975 | 17.336 |
| 3/5/19 | 18.811 | 20.388 | 15.764 | 17.218 |
| 3/6/19 | 18.649 | 20.242 | 15.537 | 16.998 |
| 3/7/19 | 18.471 | 20.261 | 15.387 | 17.005 |
| 3/8/19 | 18.474 | 20.461 | 15.408 | 17.007 |
| 3/11/19 | 18.693 | 21.19 | 15.537 | 17.271 |
| 3/12/19 | 18.649 | 21.37 | 15.548 | 17.126 |
| 3/13/19 | 18.743 | 21.501 | 15.73 | 17.401 |
| 3/14/19 | 18.563 | 21.593 | 15.616 | 17.589 |
| 3/15/19 | 18.59 | 21.716 | 15.646 | 17.405 |
| 3/18/19 | 18.785 | 21.908 | 15.764 | 17.509 |
| 3/19/19 | 18.729 | 21.957 | 15.664 | 17.394 |
| 3/20/19 | 18.717 | 21.792 | 15.47 | 17.236 |
| 3/21/19 | 18.862 | 22.053 | 15.625 | 17.614 |
| 3/22/19 | 18.637 | 21.919 | 15.234 | 17.093 |
| 3/25/19 | 18.53 | 21.693 | 15.264 | 17.271 |
| 3/26/19 | 18.749 | 22.103 | 15.848 | 17.383 |
| 3/27/19 | 18.72 | 22.03 | 15.728 | 17.204 |
| 3/28/19 | 18.856 | 22.226 | 15.784 | 17.309 |
| 3/29/19 | 18.25 | 21.485 | 16.513 | 16.662 |
| 4/1/19 | 18.478 | 21.703 | 16.584 | 17.017 |
| 4/2/19 | 18.122 | 21.414 | 16.327 | 16.632 |
| 4/3/19 | 18.134 | 21.51 | 16.02 | 16.719 |
| 4/4/19 | 18.219 | 21.433 | 16.088 | 16.718 |
| 4/5/19 | 18.396 | 21.655 | 16.29 | 16.878 |
| 4/8/19 | 18.452 | 21.559 | 16.219 | 16.863 |
| 4/9/19 | 18.225 | 21.204 | 15.951 | 16.603 |
| 4/10/19 | 18.401 | 21.248 | 16.078 | 16.806 |
| 4/11/19 | 18.581 | 21.536 | 15.996 | 16.961 |
| 4/12/19 | 18.606 | 21.644 | 15.99 | 17.067 |
| 4/15/19 | 18.498 | 21.555 | 15.988 | 17.103 |
| 4/16/19 | 18.546 | 21.259 | 15.846 | 17.113 |
| 4/17/19 | 18.538 | 21.019 | 15.541 | 17.052 |
| 4/18/19 | 18.581 | 21.041 | 15.668 | 17.055 |
| 4/22/19 | 18.623 | 21.241 | 15.799 | 17.164 |
| 4/23/19 | 18.939 | 21.673 | 15.857 | 17.43 |
| 4/24/19 | 18.945 | 21.706 | 15.767 | 17.446 |
| 4/25/19 | 18.905 | 21.706 | 15.803 | 17.186 |
| 4/26/19 | 18.951 | 21.799 | 15.878 | 17.347 |
| 4/29/19 | 19.042 | 21.647 | 15.758 | 17.448 |
| 4/30/19 | 20.924 | 21.91 | 16.084 | 17.844 |
| 5/1/19 | 20.745 | 21.673 | 15.724 | 17.395 |
| 5/2/19 | 20.827 | 21.954 | 15.724 | 18.555 |
| 5/3/19 | 21.2 | 22.135 | 16.469 | 18.748 |
| 5/6/19 | 21.104 | 22.394 | 16.774 | 18.711 |
| 5/7/19 | 20.938 | 22.009 | 16.513 | 18.262 |
| 5/8/19 | 21.121 | 21.95 | 16.607 | 18.314 |
| 5/9/19 | 21.363 | 22.268 | 16.638 | 18.576 |
| 5/10/19 | 21.494 | 22.63 | 16.831 | 18.681 |
| 5/13/19 | 21.007 | 22.106 | 16.113 | 18.039 |
| 5/14/19 | 21.158 | 22.213 | 16.225 | 18.154 |
| 5/15/19 | 21.371 | 22.423 | 16.397 | 18.508 |
| 5/16/19 | 21.724 | 22.634 | 17.18 | 18.824 |
| 5/17/19 | 21.639 | 22.608 | 17.189 | 18.651 |
| 5/20/19 | 21.434 | 22.567 | 17.255 | 18.608 |
| 5/21/19 | 21.85 | 22.815 | 17.352 | 18.815 |
| 5/22/19 | 21.918 | 22.955 | 17.229 | 19.109 |
| 5/23/19 | 21.679 | 22.882 | 16.959 | 18.762 |
| 5/24/19 | 21.719 | 23.044 | 17.281 | 18.797 |
| 5/28/19 | 21.351 | 23.222 | 17.24 | 18.573 |
| 5/29/19 | 21.3 | 23.347 | 17.071 | 18.421 |
| 5/30/19 | 21.309 | 23.188 | 17.038 | 18.49 |
| 5/31/19 | 21.451 | 23.343 | 16.847 | 18.63 |
| 6/3/19 | 21.619 | 23.295 | 16.864 | 18.421 |
| 6/4/19 | 22.211 | 23.75 | 17.046 | 18.772 |
| 6/5/19 | 22.246 | 24.016 | 17.404 | 18.711 |
| 6/6/19 | 22.411 | 24.227 | 18.649 | 18.923 |
| 6/7/19 | 22.616 | 24.408 | 18.89 | 19.044 |
| 6/10/19 | 22.544 | 24.356 | 18.996 | 18.9 |
| 6/11/19 | 22.305 | 24.001 | 18.638 | 18.562 |
| 6/12/19 | 22.567 | 24.16 | 18.803 | 18.652 |
| 6/13/19 | 22.331 | 23.953 | 19.136 | 18.673 |
| 6/14/19 | 22.451 | 24.086 | 18.704 | 18.559 |
| 6/17/19 | 22.282 | 24.123 | 18.959 | 18.582 |
| 6/18/19 | 22.391 | 24.094 | 18.917 | 18.676 |
| 6/19/19 | 22.391 | 24.212 | 19.158 | 18.876 |
| 6/20/19 | 22.684 | 24.341 | 19.257 | 19.192 |
| 6/21/19 | 22.473 | 24.426 | 18.851 | 18.622 |
| 6/24/19 | 22.485 | 24.43 | 18.803 | 18.501 |
| 6/25/19 | 22.533 | 24.434 | 18.809 | 18.611 |
| 6/26/19 | 22.357 | 24.145 | 18.614 | 18.398 |
| 6/27/19 | 22.607 | 24.463 | 18.713 | 18.81 |
| 6/28/19 | 22.271 | 23.528 | 19.002 | 19.128 |
| 7/1/19 | 22.36 | 23.692 | 18.882 | 19.56 |
| 7/2/19 | 22.352 | 23.71 | 18.959 | 19.628 |
| 7/3/19 | 22.703 | 23.99 | 19.121 | 20.035 |
| 7/5/19 | 22.876 | 24.157 | 19.314 | 20.071 |
| 7/8/19 | 22.706 | 23.855 | 19.194 | 19.603 |
| 7/9/19 | 22.737 | 24.1 | 19.481 | 19.583 |
| 7/10/19 | 22.731 | 24.264 | 19.334 | 19.668 |
| 7/11/19 | 22.854 | 24.253 | 18.992 | 19.55 |
| 7/12/19 | 22.99 | 24.456 | 19.167 | 19.955 |
| 7/15/19 | 22.965 | 24.424 | 19.152 | 19.931 |
| 7/16/19 | 22.882 | 24.324 | 19.038 | 20.008 |
| 7/17/19 | 22.527 | 24.1 | 18.816 | 19.706 |
| 7/18/19 | 22.58 | 23.944 | 18.932 | 19.83 |
| 7/19/19 | 22.198 | 23.681 | 18.732 | 19.694 |
| 7/22/19 | 22.196 | 23.813 | 18.686 | 19.716 |
| 7/23/19 | 22.544 | 23.994 | 18.728 | 19.828 |
| 7/24/19 | 22.759 | 24.093 | 18.983 | 19.95 |
| 7/25/19 | 22.633 | 24.303 | 18.675 | 19.918 |
| 7/26/19 | 22.99 | 24.591 | 18.847 | 20.319 |
| 7/29/19 | 23.239 | 25.422 | 18.899 | 20.25 |
| 7/30/19 | 23.534 | 24.744 | 18.959 | 20.134 |
| 7/31/19 | 22.898 | 24.431 | 18.741 | 20.116 |
| 8/1/19 | 23.264 | 24.502 | 18.662 | 20.198 |
| 8/2/19 | 22.831 | 24.445 | 18.502 | 19.762 |
| 8/5/19 | 22.028 | 23.937 | 17.954 | 19.18 |
| 8/6/19 | 22.324 | 24.466 | 18.021 | 19.507 |
| 8/7/19 | 22.472 | 25.039 | 18.104 | 19.561 |
| 8/8/19 | 23.4 | 25.675 | 18.735 | 20.115 |
| 8/9/19 | 23.166 | 25.732 | 18.63 | 19.749 |
| 8/12/19 | 23.163 | 25.92 | 18.563 | 19.563 |
| 8/13/19 | 23.504 | 25.657 | 18.827 | 19.732 |
| 8/14/19 | 23.099 | 25.12 | 18.242 | 19.375 |
| 8/15/19 | 23.124 | 25.412 | 18.186 | 18.979 |
| 8/16/19 | 23.378 | 25.913 | 18.677 | 19.481 |
| 8/19/19 | 23.73 | 26.119 | 18.905 | 19.578 |
| 8/20/19 | 23.559 | 26.147 | 18.578 | 19.877 |
| 8/21/19 | 23.858 | 26.673 | 18.838 | 20.314 |
| 8/22/19 | 23.863 | 26.641 | 18.948 | 20.21 |
| 8/23/19 | 23.264 | 26.108 | 18.643 | 19.73 |
| 8/26/19 | 23.512 | 26.19 | 18.973 | 19.948 |
| 8/27/19 | 23.716 | 26.179 | 18.966 | 19.92 |
| 8/28/19 | 23.908 | 26.506 | 19.17 | 20.148 |
| 8/29/19 | 24.321 | 26.726 | 19.441 | 20.658 |
| 8/30/19 | 24.365 | 26.833 | 19.709 | 20.783 |
| 9/3/19 | 24.084 | 26.798 | 19.776 | 20.662 |
| 9/4/19 | 24.438 | 27.206 | 20.03 | 20.786 |
| 9/5/19 | 24.773 | 27.398 | 20.254 | 21.233 |
| 9/6/19 | 24.438 | 27.213 | 18.605 | 21.228 |
| 9/9/19 | 23.685 | 26.179 | 18.518 | 20.522 |
| 9/10/19 | 23.426 | 24.488 | 18.22 | 19.568 |
| 9/11/19 | 23.774 | 24.712 | 18.608 | 19.862 |
| 9/12/19 | 24.084 | 25.071 | 18.69 | 20.18 |
| 9/13/19 | 23.936 | 24.69 | 18.867 | 20.196 |
| 9/16/19 | 24.07 | 24.982 | 18.755 | 20.208 |
| 9/17/19 | 24.181 | 25.888 | 18.854 | 20.255 |
| 9/18/19 | 24.432 | 25.572 | 18.867 | 21.166 |
| 9/19/19 | 24.368 | 25.774 | 18.769 | 20.963 |
| 9/20/19 | 24.078 | 24.939 | 18.892 | 21.298 |
| 9/23/19 | 23.9 | 24.85 | 18.762 | 21.225 |
| 9/24/19 | 23.989 | 24.84 | 18.946 | 21.166 |
| 9/25/19 | 24.276 | 25.206 | 19.291 | 21.627 |
| 9/26/19 | 24.301 | 25.724 | 19.407 | 21.864 |
| 9/27/19 | 22.311 | 25.188 | 19.134 | 21.27 |
| 9/30/19 | 22.536 | 24.067 | 19.562 | 22.781 |
| 10/1/19 | 22.248 | 23.762 | 19.073 | 22.277 |
| 10/2/19 | 21.77 | 23.386 | 18.74 | 22.109 |
| 10/3/19 | 21.781 | 23.688 | 18.72 | 22.179 |
| 10/4/19 | 21.946 | 24.003 | 18.937 | 22.5 |
| 10/7/19 | 21.99 | 23.854 | 18.856 | 22.594 |
| 10/8/19 | 21.476 | 23.613 | 18.484 | 22.321 |
| 10/9/19 | 21.702 | 24.01 | 18.668 | 22.428 |
| 10/10/19 | 21.794 | 24.237 | 18.681 | 22.637 |
| 10/11/19 | 21.823 | 24.223 | 18.937 | 22.636 |
| 10/14/19 | 21.639 | 23.915 | 18.639 | 22.46 |
| 10/15/19 | 21.578 | 24.034 | 18.787 | 22.571 |
| 10/16/19 | 21.345 | 24.057 | 18.675 | 22.302 |
| 10/17/19 | 21.442 | 24.003 | 18.549 | 22.347 |
| 10/18/19 | 21.418 | 23.698 | 18.218 | 22.206 |
| 10/21/19 | 21.214 | 23.718 | 18.334 | 22.144 |
| 10/22/19 | 20.807 | 23.074 | 17.911 | 21.345 |
| 10/23/19 | 20.794 | 22.918 | 17.66 | 21.22 |
| 10/24/19 | 21.004 | 23.203 | 17.685 | 21.417 |
| 10/25/19 | 20.988 | 23.173 | 17.718 | 21.445 |
| 10/28/19 | 21.206 | 23.122 | 18.03 | 21.489 |
| 10/29/19 | 22.67 | 23.701 | 18.357 | 22.01 |
| 10/30/19 | 22.749 | 24.04 | 18.487 | 22.121 |
| 10/31/19 | 22.628 | 23.847 | 18.502 | 22.041 |
| 11/1/19 | 22.392 | 25.172 | 19.979 | 22.126 |
| 11/4/19 | 22.51 | 24.877 | 19.713 | 22.028 |
| 11/5/19 | 21.828 | 24.138 | 19.379 | 21.904 |
| 11/6/19 | 22.34 | 24.328 | 19.672 | 22.134 |
| 11/7/19 | 22.568 | 24.294 | 19.794 | 22.252 |
| 11/8/19 | 22.883 | 24.328 | 19.734 | 22.256 |
| 11/11/19 | 23.006 | 24.62 | 19.674 | 22.438 |
| 11/12/19 | 23.358 | 24.508 | 19.665 | 22.624 |
| 11/13/19 | 23.484 | 24.589 | 19.358 | 22.552 |
| 11/14/19 | 23.733 | 24.826 | 19.821 | 22.679 |
| 11/15/19 | 23.888 | 24.965 | 19.787 | 22.864 |
| 11/18/19 | 23.982 | 25.057 | 20.07 | 23.069 |
| 11/19/19 | 24.066 | 24.969 | 20.154 | 23.073 |
| 11/20/19 | 24.053 | 25.084 | 20.214 | 23.15 |
| 11/21/19 | 23.631 | 24.427 | 20.204 | 23.169 |
| 11/22/19 | 23.224 | 24.179 | 19.782 | 22.785 |
| 11/25/19 | 23.625 | 24.555 | 19.886 | 23.57 |
| 11/26/19 | 23.804 | 24.877 | 20.432 | 23.659 |
| 11/27/19 | 23.875 | 24.881 | 20.627 | 23.741 |
| 11/29/19 | 23.838 | 24.657 | 20.471 | 23.575 |
| 12/2/19 | 23.578 | 24.881 | 20.286 | 23.366 |
| 12/3/19 | 23.528 | 24.281 | 20.14 | 23.226 |
| 12/4/19 | 23.549 | 24.511 | 20.248 | 23.263 |
| 12/5/19 | 23.604 | 24.477 | 20.14 | 23.283 |
| 12/6/19 | 23.796 | 24.433 | 20.348 | 23.352 |
| 12/9/19 | 23.644 | 24.04 | 19.941 | 23.307 |
| 12/10/19 | 23.523 | 23.925 | 19.941 | 23.285 |
| 12/11/19 | 24.163 | 23.681 | 19.969 | 23.501 |
| 12/12/19 | 23.93 | 23.501 | 20.077 | 23.596 |
| 12/13/19 | 24.1 | 23.912 | 20.24 | 23.663 |
| 12/16/19 | 24.048 | 23.65 | 20.209 | 23.874 |
| 12/17/19 | 24.019 | 23.722 | 20.14 | 23.865 |
| 12/18/19 | 25.108 | 23.627 | 20.401 | 24.023 |
| 12/19/19 | 25.266 | 24.013 | 20.588 | 24.378 |
| 12/20/19 | 25.719 | 24.335 | 21.054 | 24.669 |
| 12/23/19 | 25.67 | 24.254 | 21.464 | 24.686 |
| 12/24/19 | 25.725 | 24.115 | 21.188 | 24.669 |
| 12/26/19 | 25.856 | 24.061 | 21.253 | 24.787 |
| 12/27/19 | 25.777 | 24.037 | 21.171 | 24.704 |
| 12/30/19 | 25.735 | 24.081 | 21.044 | 24.722 |
| 12/31/19 | 25.688 | 23.482 | 20.871 | 23.63 |
| 1/2/20 | 25.88 | 23.736 | 21.001 | 23.842 |
| 1/3/20 | 23.488 | 23.99 | 21.157 | 24.19 |
| 1/6/20 | 23.696 | 24.377 | 21.202 | 24.41 |
| 1/7/20 | 23.609 | 24.235 | 21.205 | 24.304 |
| 1/8/20 | 23.58 | 24.449 | 21.408 | 24.534 |
| 1/9/20 | 23.866 | 25.129 | 22.289 | 24.819 |
| 1/10/20 | 23.852 | 25.308 | 22.315 | 24.866 |
| 1/13/20 | 23.883 | 25.885 | 22.648 | 25.095 |
| 1/14/20 | 23.798 | 25.905 | 22.543 | 24.965 |
| 1/15/20 | 24.116 | 26.212 | 22.864 | 25.301 |
| 1/16/20 | 24.152 | 26.077 | 22.318 | 25.473 |
| 1/17/20 | 24.412 | 26.212 | 22.205 | 25.579 |
| 1/21/20 | 24.383 | 25.961 | 21.994 | 25.518 |
| 1/22/20 | 24.194 | 25.667 | 22.006 | 25.481 |
| 1/23/20 | 24.232 | 25.875 | 21.948 | 25.708 |
| 1/24/20 | 23.994 | 25.737 | 21.509 | 25.472 |
| 1/27/20 | 23.793 | 25.608 | 21.48 | 25.303 |
| 1/28/20 | 24.156 | 25.932 | 21.759 | 25.461 |
| 1/29/20 | 24.043 | 25.826 | 21.653 | 25.255 |
| 1/30/20 | 24.22 | 25.998 | 21.689 | 26.473 |
| 1/31/20 | 23.722 | 25.763 | 20.061 | 25.279 |
| 2/3/20 | 24.192 | 25.932 | 20.454 | 25.76 |
| 2/4/20 | 24.865 | 25.898 | 20.756 | 26.106 |
| 2/5/20 | 25.176 | 25.806 | 20.914 | 25.914 |
| 2/6/20 | 25.963 | 25.869 | 21.926 | 25.931 |
| 2/7/20 | 25.998 | 25.562 | 21.202 | 25.71 |
| 2/10/20 | 26.114 | 25.582 | 21.517 | 25.722 |
| 2/11/20 | 26.478 | 25.512 | 21.73 | 25.742 |
| 2/12/20 | 26.208 | 25.113 | 21.51 | 25.764 |
| 2/13/20 | 26.704 | 25.162 | 21.554 | 26.28 |
| 2/14/20 | 26.636 | 25.304 | 21.556 | 26.077 |
| 2/18/20 | 29.094 | 25.542 | 21.734 | 26.75 |
| 2/19/20 | 28.411 | 25.268 | 21.842 | 27.135 |
| 2/20/20 | 28.161 | 24.591 | 21.942 | 26.251 |
| 2/21/20 | 27.677 | 24.146 | 21.675 | 25.812 |
| 2/24/20 | 26.876 | 23.825 | 21.044 | 25.175 |
| 2/25/20 | 25.772 | 23.264 | 19.956 | 23.97 |
| 2/26/20 | 26.166 | 23.74 | 19.426 | 24.415 |
| 2/27/20 | 24.818 | 23.664 | 18.267 | 23.534 |
| 2/28/20 | 24.237 | 23.538 | 18.315 | 23.16 |
| 3/2/20 | 25.986 | 24.446 | 18.889 | 23.738 |
| 3/3/20 | 25.814 | 24.634 | 18.964 | 23.587 |
| 3/4/20 | 26.522 | 25.43 | 19.931 | 24.591 |
| 3/5/20 | 25.398 | 24.921 | 19.266 | 23.566 |
| 3/6/20 | 24.952 | 25.185 | 18.61 | 22.83 |
| 3/9/20 | 23.028 | 23.944 | 16.445 | 21.027 |
| 3/10/20 | 24.27 | 24.644 | 17.638 | 22.154 |
| 3/11/20 | 23.132 | 24.377 | 16.285 | 20.697 |
| 3/12/20 | 20.258 | 21.917 | 14.514 | 18.384 |
| 3/13/20 | 21.323 | 23.106 | 15.728 | 20.724 |
| 3/16/20 | 18.417 | 21.075 | 13.122 | 17.852 |
| 3/17/20 | 19.215 | 21.782 | 14.256 | 17.866 |
| 3/18/20 | 18.36 | 22.99 | 12.361 | 15.9 |
| 3/19/20 | 17.923 | 21.171 | 12.804 | 17.094 |
| 3/20/20 | 17.12 | 19.131 | 11.959 | 17.45 |
| 3/23/20 | 16.724 | 18.943 | 11.867 | 17.093 |
| 3/24/20 | 18.525 | 20.871 | 14.091 | 18.682 |
| 3/25/20 | 20.334 | 21.501 | 15.387 | 19.25 |
| 3/26/20 | 21.854 | 22.584 | 16.354 | 20.526 |
| 3/27/20 | 22.062 | 22.558 | 16.409 | 20.408 |
| 3/30/20 | 22.06 | 23.532 | 16.802 | 20.515 |
| 3/31/20 | 21.64 | 21.831 | 17.058 | 19.164 |
| 4/1/20 | 20.577 | 22.136 | 16.205 | 18.539 |
| 4/2/20 | 20.926 | 22.416 | 16.861 | 18.732 |
| 4/3/20 | 20.452 | 22.283 | 16.297 | 18.24 |
| 4/6/20 | 22.069 | 23.517 | 16.992 | 20.002 |
| 4/7/20 | 21.536 | 22.702 | 16.356 | 19.958 |
| 4/8/20 | 22.197 | 22.858 | 17.074 | 20.469 |
| 4/9/20 | 22.202 | 23.615 | 17.897 | 20.878 |
| 4/13/20 | 21.415 | 22.925 | 17.602 | 20.12 |
| 4/14/20 | 22.227 | 24.127 | 18.24 | 21.631 |
| 4/15/20 | 21.562 | 23.793 | 17.346 | 21.069 |
| 4/16/20 | 21.594 | 24.08 | 17.506 | 21.458 |
| 4/17/20 | 23.09 | 24.572 | 18.736 | 22.11 |
| 4/20/20 | 22.932 | 24.137 | 18.422 | 21.653 |
| 4/21/20 | 21.992 | 23.374 | 17.773 | 20.911 |
| 4/22/20 | 22.702 | 23.739 | 18.329 | 21.536 |
| 4/23/20 | 22.992 | 23.99 | 18.738 | 21.773 |
| 4/24/20 | 23.711 | 24.127 | 19.485 | 22.09 |
| 4/27/20 | 23.909 | 24.522 | 19.993 | 22.951 |
| 4/28/20 | 23.797 | 24.226 | 19.808 | 22.614 |
| 4/29/20 | 23.946 | 23.816 | 19.885 | 23.162 |
| 4/30/20 | 22.981 | 23.358 | 18.665 | 22.702 |
| 5/1/20 | 22.767 | 23.043 | 18.206 | 22.818 |
| 5/4/20 | 23.004 | 23.144 | 18.363 | 23.082 |
| 5/5/20 | 22.895 | 23.45 | 18.572 | 22.845 |
| 5/6/20 | 22.602 | 23.453 | 18.89 | 22.432 |
| 5/7/20 | 23.346 | 23.488 | 18.952 | 22.691 |
| 5/8/20 | 23.885 | 23.211 | 19.405 | 22.438 |
| 5/11/20 | 23.739 | 23.103 | 19.423 | 22.427 |
| 5/12/20 | 23.236 | 22.652 | 18.802 | 21.58 |
| 5/13/20 | 22.213 | 22.391 | 18.282 | 20.844 |
| 5/14/20 | 22.288 | 22.238 | 18.418 | 21.14 |
| 5/15/20 | 22.518 | 22.512 | 19.092 | 21.197 |
| 5/18/20 | 22.962 | 22.47 | 19.478 | 21.704 |
| 5/19/20 | 22.75 | 22.947 | 19.014 | 21.429 |
| 5/20/20 | 23.004 | 23.723 | 19.248 | 21.615 |
| 5/21/20 | 23.118 | 23.812 | 19.402 | 21.813 |
| 5/22/20 | 23.481 | 24.111 | 19.529 | 21.976 |
| 5/26/20 | 23.781 | 24.251 | 20.217 | 22.387 |
| 5/27/20 | 23.899 | 24.378 | 20.389 | 22.844 |
| 5/28/20 | 24.271 | 25.043 | 20.378 | 22.764 |
| 5/29/20 | 24.488 | 25.368 | 20.249 | 22.76 |
| 6/1/20 | 24.648 | 25.361 | 20.688 | 22.81 |
| 6/2/20 | 24.311 | 25.578 | 20.888 | 23.248 |
| 6/3/20 | 24.946 | 25.574 | 20.78 | 23.624 |
| 6/4/20 | 24.646 | 25.651 | 20.58 | 23.761 |
| 6/5/20 | 24.664 | 25.612 | 20.12 | 23.053 |
| 6/8/20 | 24.778 | 25.721 | 20.631 | 23.351 |
| 6/9/20 | 24.581 | 25.441 | 20.327 | 23.312 |
| 6/10/20 | 24.367 | 26.001 | 20.727 | 22.981 |
| 6/11/20 | 23.343 | 24.534 | 19.375 | 21.66 |
| 6/12/20 | 23.004 | 24.48 | 19.423 | 21.903 |
| 6/15/20 | 22.936 | 24.461 | 19.248 | 21.685 |
| 6/16/20 | 23.325 | 24.795 | 19.78 | 22.226 |
| 6/17/20 | 23.302 | 25.288 | 19.465 | 22.379 |
| 6/18/20 | 23.102 | 25.533 | 18.892 | 22.015 |
| 6/19/20 | 22.49 | 25.377 | 18.487 | 21.514 |
| 6/22/20 | 22.534 | 25.415 | 18.515 | 21.373 |
| 6/23/20 | 22.367 | 25.447 | 17.988 | 21.2 |
| 6/24/20 | 21.688 | 24.553 | 17.075 | 20.383 |
| 6/25/20 | 21.564 | 24.658 | 17.349 | 19.886 |
| 6/26/20 | 20.88 | 23.66 | 17.282 | 19.522 |
| 6/29/20 | 21.443 | 24.102 | 17.781 | 19.884 |
| 6/30/20 | 21.785 | 24.053 | 17.866 | 17.073 |
| 7/1/20 | 21.701 | 24.573 | 17.76 | 17.199 |
| 7/2/20 | 20.424 | 24.601 | 17.795 | 17.274 |
| 7/6/20 | 19.292 | 23.945 | 17.066 | 16.598 |
| 7/7/20 | 19.17 | 23.314 | 16.659 | 16.135 |
| 7/8/20 | 19.207 | 23.336 | 16.564 | 15.976 |
| 7/9/20 | 18.847 | 23.271 | 16.074 | 15.393 |
| 7/10/20 | 19.174 | 23.287 | 16.334 | 15.71 |
| 7/13/20 | 18.548 | 22.161 | 15.863 | 15.447 |
| 7/14/20 | 18.801 | 22.328 | 16.274 | 15.304 |
| 7/15/20 | 19.154 | 22.418 | 16.815 | 15.693 |
| 7/16/20 | 18.884 | 21.923 | 16.447 | 15.381 |
| 7/17/20 | 19.231 | 22.34 | 16.537 | 15.531 |
| 7/20/20 | 19.333 | 22.501 | 16.624 | 15.924 |
| 7/21/20 | 19.436 | 22.594 | 16.67 | 16.004 |
| 7/22/20 | 19.929 | 23.246 | 17.599 | 16.385 |
| 7/23/20 | 19.776 | 22.987 | 17.415 | 16.224 |
| 7/24/20 | 19.863 | 22.987 | 17.56 | 16.102 |
| 7/27/20 | 19.665 | 23.076 | 17.903 | 15.862 |
| 7/28/20 | 19.669 | 23.225 | 17.579 | 15.662 |
| 7/29/20 | 20.06 | 23.654 | 17.806 | 16.006 |
| 7/30/20 | 20.145 | 24.035 | 17.949 | 16.112 |
| 7/31/20 | 20.756 | 25.281 | 18.261 | 16.36 |
| 8/3/20 | 21.44 | 25.822 | 18.56 | 16.664 |
| 8/4/20 | 20.125 | 25.689 | 18.468 | 16.262 |
| 8/5/20 | 19.571 | 25.513 | 18.352 | 16.176 |
| 8/6/20 | 19.85 | 25.634 | 18.505 | 16.247 |
| 8/7/20 | 20.33 | 26.181 | 19.01 | 16.601 |
| 8/10/20 | 20.594 | 26.178 | 19.156 | 16.616 |
| 8/11/20 | 20.928 | 26.604 | 19.478 | 16.729 |
| 8/12/20 | 20.592 | 26.505 | 19.284 | 16.766 |
| 8/13/20 | 20.588 | 26.515 | 19.402 | 17.708 |
| 8/14/20 | 20.66 | 26.725 | 19.676 | 18.07 |
| 8/17/20 | 20.119 | 26.49 | 19.085 | 18.072 |
| 8/18/20 | 20.025 | 26.543 | 19.336 | 17.781 |
| 8/19/20 | 20.197 | 26.654 | 19.462 | 17.982 |
| 8/20/20 | 19.852 | 26.818 | 19.146 | 18.018 |
| 8/21/20 | 19.449 | 26.691 | 18.904 | 18.274 |
| 8/24/20 | 19.807 | 27.019 | 19.067 | 18.532 |
| 8/25/20 | 19.765 | 26.722 | 18.829 | 18.407 |
| 8/26/20 | 19.748 | 27.05 | 18.596 | 18.297 |
| 8/27/20 | 19.996 | 27.39 | 19.012 | 18.518 |
| 8/28/20 | 19.916 | 27.448 | 18.957 | 18.537 |
| 8/31/20 | 19.737 | 27.229 | 19.055 | 18.436 |
| 9/1/20 | 19.565 | 27.337 | 18.904 | 18.657 |
| 9/2/20 | 19.988 | 27.408 | 19.391 | 18.92 |
| 9/3/20 | 19.414 | 26.725 | 18.991 | 18.186 |
| 9/4/20 | 19.301 | 26.277 | 18.752 | 17.856 |
| 9/8/20 | 18.878 | 25.906 | 18 | 17.575 |
| 9/9/20 | 19.013 | 26.561 | 18.037 | 17.718 |
| 9/10/20 | 18.736 | 26.02 | 17.562 | 17.588 |
| 9/11/20 | 19.013 | 25.98 | 17.585 | 17.483 |
| 9/14/20 | 19.268 | 25.89 | 17.973 | 17.505 |
| 9/15/20 | 19.355 | 25.933 | 18.021 | 17.735 |
| 9/16/20 | 19.434 | 26.215 | 17.991 | 17.612 |
| 9/17/20 | 19.68 | 26.227 | 17.822 | 17.423 |
| 9/18/20 | 19.643 | 26.175 | 17.512 | 17.173 |
| 9/21/20 | 19.288 | 26.487 | 17.457 | 16.96 |
| 9/22/20 | 19.979 | 27.019 | 17.886 | 17.73 |
| 9/23/20 | 19.63 | 25.924 | 17.254 | 17.097 |
| 9/24/20 | 19.2 | 25.671 | 17.514 | 16.757 |
| 9/25/20 | 20.062 | 26.233 | 17.806 | 16.996 |
| 9/28/20 | 19.972 | 26.267 | 18.236 | 17.136 |
| 9/29/20 | 19.754 | 26.048 | 17.946 | 16.909 |
| 9/30/20 | 19.445 | 23.977 | 17.904 | 15.572 |
| 10/1/20 | 19.722 | 23.997 | 18.012 | 15.724 |
| 10/2/20 | 19.775 | 23.939 | 18.087 | 15.749 |
| 10/5/20 | 19.651 | 23.821 | 18.242 | 15.713 |
| 10/6/20 | 19.474 | 23.769 | 18.311 | 15.524 |
| 10/7/20 | 19.358 | 23.575 | 18.236 | 15.458 |
| 10/8/20 | 19.513 | 23.508 | 18.322 | 15.42 |
| 10/9/20 | 19.88 | 23.451 | 18.288 | 15.593 |
| 10/12/20 | 19.627 | 23.566 | 18.758 | 15.834 |
| 10/13/20 | 19.294 | 23.402 | 18.697 | 15.924 |
| 10/14/20 | 19.36 | 23.8 | 18.43 | 15.867 |
| 10/15/20 | 19.204 | 23.699 | 18.151 | 15.764 |
| 10/16/20 | 19.215 | 23.766 | 18.532 | 15.742 |
| 10/19/20 | 18.894 | 23.101 | 18.172 | 15.34 |
| 10/20/20 | 18.843 | 22.983 | 17.978 | 15.488 |
| 10/21/20 | 18.5 | 22.749 | 17.678 | 15.415 |
| 10/22/20 | 18.773 | 22.665 | 17.633 | 15.502 |
| 10/23/20 | 18.771 | 22.841 | 17.756 | 15.54 |
| 10/26/20 | 18.255 | 22.503 | 17.313 | 15.035 |
| 10/27/20 | 18.093 | 22.439 | 17.051 | 14.781 |
| 10/28/20 | 17.358 | 21.567 | 16.74 | 14.536 |
| 10/29/20 | 17.776 | 21.76 | 17.069 | 14.87 |
| 10/30/20 | 18.159 | 22.682 | 17.475 | 15.234 |
| 11/2/20 | 18.756 | 23.459 | 18.049 | 15.798 |
| 11/3/20 | 19.244 | 24.179 | 18.598 | 16.057 |
| 11/4/20 | 20.198 | 25.364 | 19.17 | 16.949 |
| 11/5/20 | 19.996 | 24.936 | 19.42 | 16.8 |
| 11/6/20 | 19.793 | 25.023 | 18.935 | 16.543 |
| 11/9/20 | 20.703 | 24.982 | 19.623 | 17.112 |
| 11/10/20 | 20.771 | 25.02 | 19.912 | 17.177 |
| 11/11/20 | 20.782 | 24.858 | 19.939 | 17.019 |
| 11/12/20 | 20.6 | 25 | 19.662 | 16.958 |
| 11/13/20 | 21.543 | 25.306 | 20.319 | 17.301 |
| 11/16/20 | 22.016 | 25.826 | 20.763 | 17.52 |
| 11/17/20 | 21.939 | 25.762 | 20.88 | 17.494 |
| 11/18/20 | 21.775 | 25.456 | 20.518 | 17.406 |
| 11/19/20 | 21.952 | 25.47 | 20.408 | 17.388 |
| 11/20/20 | 21.959 | 25.193 | 20.628 | 17.321 |
| 11/23/20 | 22.398 | 25.387 | 21.25 | 17.496 |
| 11/24/20 | 22.44 | 25.375 | 21.63 | 17.616 |
| 11/25/20 | 22.455 | 25.427 | 21.605 | 17.637 |
| 11/27/20 | 22.377 | 25.465 | 21.523 | 17.698 |
| 11/30/20 | 22.031 | 25.078 | 21.175 | 17.335 |
| 12/1/20 | 22.237 | 25.774 | 21.376 | 17.49 |
| 12/2/20 | 22.556 | 25.583 | 21.546 | 17.592 |
| 12/3/20 | 22.51 | 25.537 | 21.664 | 17.716 |
| 12/4/20 | 22.93 | 25.551 | 22.376 | 18.036 |
| 12/7/20 | 22.644 | 25.606 | 22.092 | 18.019 |
| 12/8/20 | 22.742 | 25.436 | 22.301 | 18.097 |
| 12/9/20 | 22.777 | 25.254 | 22.733 | 17.832 |
| 12/10/20 | 22.932 | 25.323 | 22.802 | 17.724 |
| 12/11/20 | 23.064 | 25.361 | 22.6 | 17.744 |
| 12/14/20 | 22.781 | 25.511 | 22.227 | 17.676 |
| 12/15/20 | 22.937 | 25.782 | 22.724 | 17.875 |
| 12/16/20 | 22.991 | 26.202 | 22.628 | 17.894 |
| 12/17/20 | 22.934 | 25.728 | 22.372 | 17.779 |
| 12/18/20 | 23.118 | 25.947 | 22.472 | 18.101 |
| 12/21/20 | 22.563 | 25.332 | 22.248 | 17.888 |
| 12/22/20 | 22.392 | 25.196 | 21.98 | 17.968 |
| 12/23/20 | 22.886 | 25.28 | 22.113 | 18.155 |
| 12/24/20 | 22.806 | 25.245 | 22.152 | 18.008 |
| 12/28/20 | 22.924 | 25.32 | 22.308 | 18.229 |
| 12/29/20 | 22.663 | 25.202 | 21.809 | 18.194 |
| 12/30/20 | 22.749 | 25.132 | 21.61 | 18.126 |
| 12/31/20 | 22.358 | 23.728 | 21.655 | 16.969 |
| 1/4/21 | 21.788 | 23.402 | 21.198 | 16.413 |
| 1/5/21 | 21.799 | 23.587 | 21.321 | 16.277 |
| 1/6/21 | 22.118 | 24.14 | 21.742 | 16.242 |
| 1/7/21 | 22.158 | 24.727 | 21.866 | 16.325 |
| 1/8/21 | 22.26 | 24.932 | 21.788 | 16.229 |
| 1/11/21 | 22.118 | 24.874 | 21.454 | 16.324 |
| 1/12/21 | 22.413 | 25.228 | 21.852 | 16.457 |
| 1/13/21 | 22.458 | 24.866 | 21.738 | 16.273 |
| 1/14/21 | 22.603 | 24.893 | 22.163 | 16.517 |
| 1/15/21 | 22.792 | 25.089 | 22.495 | 16.692 |
| 1/19/21 | 23.202 | 25.558 | 22.909 | 16.867 |
| 1/20/21 | 23.319 | 25.857 | 23.113 | 17.001 |
| 1/21/21 | 23.249 | 25.8 | 22.896 | 16.954 |
| 1/22/21 | 23.832 | 26.11 | 23.088 | 17.264 |
| 1/25/21 | 23.97 | 26.554 | 23.22 | 17.225 |
| 1/26/21 | 23.774 | 26.63 | 23.09 | 17.191 |
| 1/27/21 | 23.687 | 26.556 | 23.591 | 17.642 |
| 1/28/21 | 23.09 | 25.966 | 22.921 | 16.783 |
| 1/29/21 | 22.558 | 23.181 | 22.396 | 16.417 |
| 2/1/21 | 22.345 | 22.795 | 22.144 | 16.287 |
| 2/2/21 | 22.507 | 22.697 | 21.986 | 16.36 |
| 2/3/21 | 22.007 | 22.272 | 21.869 | 16.261 |
| 2/4/21 | 22.815 | 22.7 | 22.212 | 16.322 |
| 2/5/21 | 22.707 | 22.343 | 22.214 | 16.167 |
| 2/8/21 | 22.99 | 22.305 | 22.37 | 16.343 |
| 2/9/21 | 23.341 | 22.634 | 22.881 | 16.519 |
| 2/10/21 | 23.258 | 22.738 | 22.59 | 16.272 |
| 2/11/21 | 23.349 | 23.024 | 22.818 | 16.402 |
| 2/12/21 | 22.928 | 22.479 | 22.443 | 16.112 |
| 2/16/21 | 22.379 | 22.109 | 21.925 | 16.15 |
| 2/17/21 | 22.435 | 21.965 | 22.104 | 16.5 |
| 2/18/21 | 22.339 | 21.674 | 21.773 | 16.141 |
| 2/19/21 | 22.069 | 21.423 | 21.659 | 16.001 |
| 2/22/21 | 22.077 | 21.031 | 21.827 | 15.945 |
| 2/23/21 | 19.889 | 20.947 | 21.451 | 15.809 |
| 2/24/21 | 19.223 | 21.23 | 21.27 | 15.552 |
| 2/25/21 | 18.957 | 21.268 | 20.437 | 15.327 |
| 2/26/21 | 18.812 | 20.996 | 20.087 | 15.064 |
| 3/1/21 | 19.661 | 21.608 | 20.934 | 15.444 |
| 3/2/21 | 19.151 | 21.521 | 20.15 | 14.886 |
| 3/3/21 | 19.2 | 21.412 | 20.066 | 14.726 |
| 3/4/21 | 18.946 | 20.871 | 20.075 | 14.733 |
| 3/5/21 | 19.295 | 20.89 | 20.584 | 14.855 |
| 3/8/21 | 19.568 | 21.298 | 20.63 | 14.875 |
| 3/9/21 | 19.836 | 21.241 | 20.931 | 15.192 |
| 3/10/21 | 20.093 | 21.344 | 21.234 | 15.313 |
| 3/11/21 | 20.127 | 21.445 | 21.652 | 16.11 |
| 3/12/21 | 20.191 | 21.38 | 21.932 | 16.438 |
| 3/15/21 | 20.265 | 21.946 | 22.401 | 16.913 |
| 3/16/21 | 20.131 | 21.622 | 22.093 | 16.76 |
| 3/17/21 | 20.693 | 21.788 | 22.387 | 16.791 |
| 3/18/21 | 20.633 | 21.929 | 22.632 | 16.922 |
| 3/19/21 | 20.195 | 21.706 | 22.429 | 16.841 |
| 3/22/21 | 20.306 | 21.728 | 22.459 | 17.022 |
| 3/23/21 | 20.044 | 21.788 | 22.326 | 16.746 |
| 3/24/21 | 20.18 | 21.701 | 22.116 | 16.662 |
| 3/25/21 | 20.474 | 21.878 | 22.363 | 16.711 |
| 3/26/21 | 20.461 | 21.709 | 18.657 | 16.443 |
| 3/29/21 | 20.882 | 22.161 | 19.194 | 16.875 |
| 3/30/21 | 20.561 | 21.984 | 19.471 | 16.76 |
| 3/31/21 | 20.478 | 20.978 | 19.495 | 15.123 |
| 4/1/21 | 18.61 | 21.286 | 19.264 | 15.242 |
| 4/5/21 | 19.279 | 21.802 | 19.824 | 15.711 |
| 4/6/21 | 19.241 | 21.492 | 19.46 | 15.671 |
| 4/7/21 | 19.011 | 21.421 | 19.686 | 15.407 |
| 4/8/21 | 19.36 | 21.366 | 20.106 | 15.279 |
| 4/9/21 | 19.422 | 21.429 | 19.868 | 15.411 |
| 4/12/21 | 19.403 | 21.63 | 20.057 | 15.544 |
| 4/13/21 | 19.208 | 21.502 | 20.073 | 15.328 |
| 4/14/21 | 19.316 | 21.57 | 20.227 | 15.477 |
| 4/15/21 | 19.511 | 21.716 | 20.47 | 15.772 |
| 4/16/21 | 19.528 | 22.057 | 20.591 | 15.969 |
| 4/19/21 | 19.582 | 22.098 | 20.654 | 16.092 |
| 4/20/21 | 19.59 | 21.723 | 20.544 | 16.055 |
| 4/21/21 | 19.567 | 21.867 | 20.463 | 15.665 |
| 4/22/21 | 19.544 | 21.807 | 20.341 | 15.843 |
| 4/23/21 | 19.422 | 21.716 | 20.376 | 15.602 |
| 4/26/21 | 19.268 | 21.544 | 20.353 | 15.546 |
| 4/27/21 | 19.347 | 21.593 | 20.526 | 15.56 |
| 4/28/21 | 19.133 | 21.306 | 20.572 | 15.399 |
| 4/29/21 | 19.453 | 21.71 | 20.854 | 15.576 |
| 4/30/21 | 19.542 | 21.609 | 18.234 | 15.626 |
| 5/3/21 | 20.009 | 21.848 | 18.369 | 16.069 |
| 5/4/21 | 20.221 | 22.302 | 18.491 | 16.152 |
| 5/5/21 | 20.01 | 21.809 | 18.198 | 16.104 |
| 5/6/21 | 20.047 | 21.898 | 18.071 | 16.046 |
| 5/7/21 | 20.072 | 21.911 | 18.414 | 16.205 |
| 5/10/21 | 20.159 | 21.716 | 18.416 | 16.174 |
| 5/11/21 | 20.198 | 21.283 | 18.13 | 15.918 |
| 5/12/21 | 19.578 | 21.02 | 17.824 | 15.573 |
| 5/13/21 | 19.96 | 21.65 | 17.89 | 15.871 |
| 5/14/21 | 19.947 | 21.661 | 17.988 | 15.939 |
| 5/17/21 | 19.947 | 21.69 | 18.075 | 15.92 |
| 5/18/21 | 19.875 | 21.455 | 18.084 | 15.956 |
| 5/19/21 | 19.698 | 21.189 | 17.706 | 15.801 |
| 5/20/21 | 19.823 | 21.377 | 17.906 | 15.725 |
| 5/21/21 | 19.823 | 21.783 | 18.084 | 15.76 |
| 5/24/21 | 19.864 | 22.336 | 18.308 | 15.828 |
| 5/25/21 | 19.75 | 22.151 | 18.141 | 15.656 |
| 5/26/21 | 19.794 | 22.322 | 18.181 | 15.595 |
| 5/27/21 | 19.856 | 22.263 | 18.138 | 15.613 |
| 5/28/21 | 19.825 | 22.124 | 18.324 | 15.632 |
| 6/1/21 | 19.912 | 22.132 | 18.489 | 15.704 |
| 6/2/21 | 20.009 | 22.422 | 18.677 | 15.792 |
| 6/3/21 | 19.978 | 22.2 | 18.722 | 15.749 |
| 6/4/21 | 20.119 | 22.302 | 19.136 | 15.885 |
| 6/7/21 | 20.149 | 22.445 | 18.893 | 15.801 |
| 6/8/21 | 20.242 | 22.468 | 18.824 | 15.942 |
| 6/9/21 | 20.246 | 22.765 | 18.795 | 15.98 |
| 6/10/21 | 20.584 | 22.979 | 19.117 | 16.23 |
| 6/11/21 | 20.624 | 22.958 | 19.156 | 16.344 |
| 6/14/21 | 20.587 | 22.802 | 19.134 | 16.177 |
| 6/15/21 | 20.676 | 22.856 | 19.26 | 16.305 |
| 6/16/21 | 20.431 | 22.864 | 19.128 | 16.191 |
| 6/17/21 | 20.433 | 22.838 | 19.05 | 16.176 |
| 6/18/21 | 19.958 | 22.549 | 18.675 | 15.989 |
| 6/21/21 | 20.416 | 22.987 | 18.885 | 16.131 |
| 6/22/21 | 20.344 | 23.083 | 18.864 | 16.053 |
| 6/23/21 | 19.978 | 22.7 | 18.608 | 15.863 |
| 6/24/21 | 19.887 | 22.526 | 18.455 | 15.797 |
| 6/25/21 | 19.914 | 22.789 | 18.73 | 15.967 |
| 6/28/21 | 19.702 | 22.359 | 18.155 | 15.818 |
| 6/29/21 | 19.474 | 22.171 | 17.896 | 15.649 |
| 6/30/21 | 19.507 | 22.269 | 17.89 | 13.888 |
| 7/1/21 | 19.879 | 22.533 | 17.998 | 13.982 |
| 7/2/21 | 19.756 | 22.679 | 17.8 | 14.014 |
| 7/6/21 | 19.53 | 22.784 | 17.741 | 13.954 |
| 7/7/21 | 20.031 | 23.254 | 18.051 | 14.073 |
| 7/8/21 | 19.981 | 23.076 | 17.971 | 14.08 |
| 7/9/21 | 20.195 | 23.215 | 18.128 | 14.216 |
| 7/12/21 | 20.243 | 23.249 | 18.145 | 14.191 |
| 7/13/21 | 20.174 | 23.22 | 18.018 | 14.17 |
| 7/14/21 | 20.137 | 23.228 | 17.992 | 14.208 |
| 7/15/21 | 20.313 | 23.359 | 18.022 | 14.274 |
| 7/16/21 | 20.472 | 23.385 | 18.196 | 14.38 |
| 7/19/21 | 19.889 | 22.988 | 17.555 | 14.209 |
| 7/20/21 | 20.216 | 23.317 | 17.949 | 14.409 |
| 7/21/21 | 20.351 | 23.215 | 17.967 | 14.496 |
| 7/22/21 | 20.266 | 23.21 | 17.757 | 14.512 |
| 7/23/21 | 20.499 | 23.448 | 17.967 | 14.623 |
| 7/26/21 | 20.507 | 23.474 | 17.896 | 14.583 |
| 7/27/21 | 20.565 | 23.471 | 17.837 | 14.614 |
| 7/28/21 | 20.521 | 23.508 | 17.898 | 14.628 |
| 7/29/21 | 20.605 | 23.453 | 17.978 | 14.636 |
| 7/30/21 | 20.499 | 22.433 | 15.914 | 14.532 |
| 8/2/21 | 20.632 | 22.423 | 15.877 | 14.604 |
| 8/3/21 | 18.375 | 21.636 | 15.256 | 13.96 |
| 8/4/21 | 18.2 | 21.437 | 15.013 | 13.759 |
| 8/5/21 | 18.155 | 21.44 | 15.021 | 13.696 |
| 8/6/21 | 18.18 | 21.38 | 15.042 | 13.735 |
| 8/9/21 | 18.051 | 21.168 | 14.991 | 13.673 |
| 8/10/21 | 18.217 | 21.228 | 15.019 | 13.788 |
| 8/11/21 | 18.564 | 21.367 | 15.159 | 13.807 |
| 8/12/21 | 18.471 | 21.317 | 15.101 | 13.805 |
| 8/13/21 | 18.423 | 21.066 | 15.227 | 13.716 |
| 8/16/21 | 18.856 | 21.299 | 15.391 | 13.893 |
| 8/17/21 | 19.039 | 21.351 | 15.584 | 14.154 |
| 8/18/21 | 18.614 | 20.899 | 15.183 | 14.019 |
| 8/19/21 | 18.621 | 21.257 | 15.161 | 14.033 |
| 8/20/21 | 18.552 | 21.503 | 15.254 | 14.134 |
| 8/23/21 | 18.56 | 21.257 | 15.287 | 14.019 |
| 8/24/21 | 18.635 | 21.192 | 15.316 | 13.963 |
| 8/25/21 | 18.802 | 21.278 | 15.287 | 14.007 |
| 8/26/21 | 18.856 | 21.205 | 15.425 | 13.969 |
| 8/27/21 | 18.918 | 21.354 | 15.447 | 14.03 |
| 8/30/21 | 18.889 | 21.374 | 15.372 | 13.976 |
| 8/31/21 | 18.899 | 21.414 | 15.354 | 14.019 |
| 9/1/21 | 18.831 | 21.563 | 15.334 | 13.961 |
| 9/2/21 | 19.101 | 21.863 | 15.564 | 14.095 |
| 9/3/21 | 19.074 | 21.73 | 15.883 | 13.953 |
| 9/7/21 | 18.82 | 21.411 | 15.506 | 13.731 |
| 9/8/21 | 19.053 | 21.633 | 15.726 | 14.002 |
| 9/9/21 | 19.082 | 21.529 | 15.588 | 14.068 |
| 9/10/21 | 18.731 | 21.304 | 15.36 | 13.928 |
| 9/13/21 | 18.924 | 21.5 | 15.801 | 14.035 |
| 9/14/21 | 18.224 | 20.907 | 15.427 | 13.718 |
| 9/15/21 | 18.134 | 21.056 | 15.648 | 13.767 |
| 9/16/21 | 17.722 | 20.946 | 15.398 | 13.686 |
| 9/17/21 | 17.685 | 20.896 | 15.387 | 13.759 |
| 9/20/21 | 17.766 | 20.87 | 15.29 | 13.694 |
| 9/21/21 | 17.51 | 20.41 | 15.128 | 13.571 |
| 9/22/21 | 17.762 | 20.491 | 15.312 | 13.616 |
| 9/23/21 | 17.92 | 20.504 | 15.462 | 13.685 |
| 9/24/21 | 18.252 | 20.69 | 15.629 | 13.906 |
| 9/27/21 | 18.61 | 20.776 | 15.821 | 14.025 |
| 9/28/21 | 18.6 | 20.517 | 15.713 | 14.154 |
| 9/29/21 | 18.868 | 20.771 | 15.795 | 14.423 |
| 9/30/21 | 18.517 | 20.233 | 15.597 | 14.244 |
| 10/1/21 | 18.768 | 20.606 | 15.666 | 14.408 |
| 10/4/21 | 18.85 | 20.718 | 15.77 | 14.56 |
| 10/5/21 | 18.573 | 20.358 | 15.631 | 14.396 |
| 10/6/21 | 18.673 | 20.47 | 15.737 | 14.457 |
| 10/7/21 | 18.777 | 20.654 | 15.95 | 14.674 |
| 10/8/21 | 19.047 | 20.608 | 16.032 | 14.935 |
| 10/11/21 | 18.818 | 20.481 | 16.012 | 14.849 |
| 10/12/21 | 18.928 | 20.447 | 16.072 | 15.014 |
| 10/13/21 | 18.92 | 20.478 | 16.224 | 15.087 |
| 10/14/21 | 19.163 | 20.567 | 16.32 | 15.225 |
| 10/15/21 | 19.319 | 20.646 | 16.435 | 15.32 |
| 10/18/21 | 19.203 | 20.613 | 16.207 | 15.322 |
| 10/19/21 | 19.203 | 20.646 | 16.344 | 15.291 |
| 10/20/21 | 19.322 | 20.692 | 16.468 | 15.346 |
| 10/21/21 | 19.538 | 21.192 | 16.606 | 15.41 |
| 10/22/21 | 19.656 | 21.151 | 16.745 | 15.493 |
| 10/25/21 | 19.619 | 21.332 | 16.683 | 15.452 |
| 10/26/21 | 19.455 | 21.072 | 16.413 | 15.311 |
| 10/27/21 | 19.064 | 20.32 | 15.522 | 14.791 |
| 10/28/21 | 18.978 | 20.542 | 15.773 | 15.094 |
| 10/29/21 | 19.259 | 22.148 | 16.366 | 15.632 |